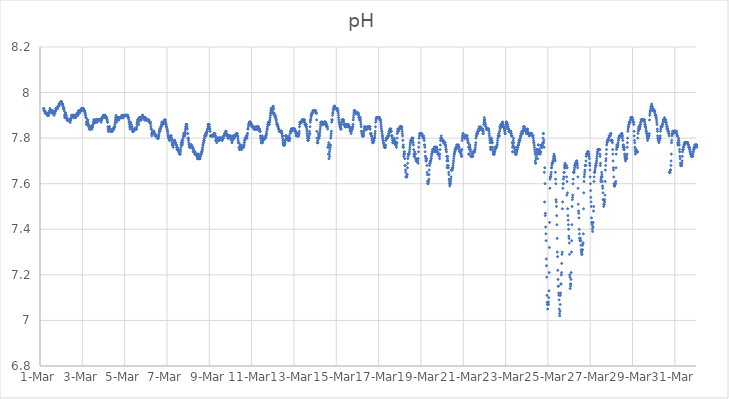
| Category | pH |
|---|---|
| 44621.166666666664 | 7.93 |
| 44621.177083333336 | 7.93 |
| 44621.1875 | 7.92 |
| 44621.197916666664 | 7.92 |
| 44621.208333333336 | 7.92 |
| 44621.21875 | 7.92 |
| 44621.229166666664 | 7.92 |
| 44621.239583333336 | 7.91 |
| 44621.25 | 7.91 |
| 44621.260416666664 | 7.91 |
| 44621.270833333336 | 7.91 |
| 44621.28125 | 7.91 |
| 44621.291666666664 | 7.91 |
| 44621.302083333336 | 7.91 |
| 44621.3125 | 7.91 |
| 44621.322916666664 | 7.91 |
| 44621.333333333336 | 7.91 |
| 44621.34375 | 7.9 |
| 44621.354166666664 | 7.9 |
| 44621.364583333336 | 7.9 |
| 44621.375 | 7.9 |
| 44621.385416666664 | 7.9 |
| 44621.395833333336 | 7.9 |
| 44621.40625 | 7.9 |
| 44621.416666666664 | 7.91 |
| 44621.427083333336 | 7.91 |
| 44621.4375 | 7.91 |
| 44621.447916666664 | 7.92 |
| 44621.458333333336 | 7.92 |
| 44621.46875 | 7.93 |
| 44621.479166666664 | 7.92 |
| 44621.489583333336 | 7.92 |
| 44621.5 | 7.92 |
| 44621.510416666664 | 7.92 |
| 44621.520833333336 | 7.92 |
| 44621.53125 | 7.92 |
| 44621.541666666664 | 7.92 |
| 44621.552083333336 | 7.91 |
| 44621.5625 | 7.92 |
| 44621.572916666664 | 7.92 |
| 44621.583333333336 | 7.92 |
| 44621.59375 | 7.91 |
| 44621.604166666664 | 7.92 |
| 44621.614583333336 | 7.91 |
| 44621.625 | 7.91 |
| 44621.635416666664 | 7.91 |
| 44621.645833333336 | 7.91 |
| 44621.65625 | 7.91 |
| 44621.666666666664 | 7.9 |
| 44621.677083333336 | 7.91 |
| 44621.6875 | 7.91 |
| 44621.697916666664 | 7.91 |
| 44621.708333333336 | 7.91 |
| 44621.71875 | 7.92 |
| 44621.729166666664 | 7.92 |
| 44621.739583333336 | 7.92 |
| 44621.75 | 7.93 |
| 44621.760416666664 | 7.93 |
| 44621.770833333336 | 7.93 |
| 44621.78125 | 7.93 |
| 44621.791666666664 | 7.93 |
| 44621.802083333336 | 7.93 |
| 44621.8125 | 7.93 |
| 44621.822916666664 | 7.93 |
| 44621.833333333336 | 7.93 |
| 44621.84375 | 7.94 |
| 44621.854166666664 | 7.94 |
| 44621.864583333336 | 7.94 |
| 44621.875 | 7.94 |
| 44621.885416666664 | 7.94 |
| 44621.895833333336 | 7.95 |
| 44621.90625 | 7.95 |
| 44621.916666666664 | 7.95 |
| 44621.927083333336 | 7.95 |
| 44621.9375 | 7.95 |
| 44621.947916666664 | 7.95 |
| 44621.958333333336 | 7.95 |
| 44621.96875 | 7.95 |
| 44621.979166666664 | 7.96 |
| 44621.989583333336 | 7.96 |
| 44622.0 | 7.96 |
| 44622.010416666664 | 7.96 |
| 44622.020833333336 | 7.96 |
| 44622.03125 | 7.95 |
| 44622.041666666664 | 7.95 |
| 44622.052083333336 | 7.95 |
| 44622.0625 | 7.95 |
| 44622.072916666664 | 7.95 |
| 44622.083333333336 | 7.94 |
| 44622.09375 | 7.94 |
| 44622.104166666664 | 7.93 |
| 44622.114583333336 | 7.93 |
| 44622.125 | 7.93 |
| 44622.135416666664 | 7.93 |
| 44622.145833333336 | 7.92 |
| 44622.15625 | 7.9 |
| 44622.166666666664 | 7.89 |
| 44622.177083333336 | 7.9 |
| 44622.1875 | 7.91 |
| 44622.197916666664 | 7.91 |
| 44622.208333333336 | 7.91 |
| 44622.21875 | 7.9 |
| 44622.229166666664 | 7.9 |
| 44622.239583333336 | 7.9 |
| 44622.25 | 7.89 |
| 44622.260416666664 | 7.89 |
| 44622.270833333336 | 7.88 |
| 44622.28125 | 7.88 |
| 44622.291666666664 | 7.88 |
| 44622.302083333336 | 7.88 |
| 44622.3125 | 7.88 |
| 44622.322916666664 | 7.88 |
| 44622.333333333336 | 7.88 |
| 44622.34375 | 7.88 |
| 44622.354166666664 | 7.88 |
| 44622.364583333336 | 7.88 |
| 44622.375 | 7.88 |
| 44622.385416666664 | 7.88 |
| 44622.395833333336 | 7.88 |
| 44622.40625 | 7.88 |
| 44622.416666666664 | 7.87 |
| 44622.427083333336 | 7.87 |
| 44622.4375 | 7.88 |
| 44622.447916666664 | 7.88 |
| 44622.458333333336 | 7.88 |
| 44622.46875 | 7.89 |
| 44622.479166666664 | 7.89 |
| 44622.489583333336 | 7.9 |
| 44622.5 | 7.9 |
| 44622.510416666664 | 7.9 |
| 44622.520833333336 | 7.9 |
| 44622.53125 | 7.9 |
| 44622.541666666664 | 7.9 |
| 44622.552083333336 | 7.9 |
| 44622.5625 | 7.9 |
| 44622.572916666664 | 7.9 |
| 44622.583333333336 | 7.89 |
| 44622.59375 | 7.89 |
| 44622.604166666664 | 7.9 |
| 44622.614583333336 | 7.9 |
| 44622.625 | 7.9 |
| 44622.635416666664 | 7.9 |
| 44622.645833333336 | 7.9 |
| 44622.65625 | 7.9 |
| 44622.666666666664 | 7.89 |
| 44622.677083333336 | 7.9 |
| 44622.6875 | 7.89 |
| 44622.697916666664 | 7.9 |
| 44622.708333333336 | 7.9 |
| 44622.71875 | 7.9 |
| 44622.729166666664 | 7.9 |
| 44622.739583333336 | 7.9 |
| 44622.75 | 7.91 |
| 44622.760416666664 | 7.91 |
| 44622.770833333336 | 7.91 |
| 44622.78125 | 7.9 |
| 44622.791666666664 | 7.9 |
| 44622.802083333336 | 7.91 |
| 44622.8125 | 7.91 |
| 44622.822916666664 | 7.92 |
| 44622.833333333336 | 7.92 |
| 44622.84375 | 7.92 |
| 44622.854166666664 | 7.92 |
| 44622.864583333336 | 7.91 |
| 44622.875 | 7.91 |
| 44622.885416666664 | 7.92 |
| 44622.895833333336 | 7.92 |
| 44622.90625 | 7.92 |
| 44622.916666666664 | 7.92 |
| 44622.927083333336 | 7.92 |
| 44622.9375 | 7.92 |
| 44622.947916666664 | 7.92 |
| 44622.958333333336 | 7.93 |
| 44622.96875 | 7.93 |
| 44622.979166666664 | 7.93 |
| 44622.989583333336 | 7.93 |
| 44623.0 | 7.93 |
| 44623.010416666664 | 7.93 |
| 44623.020833333336 | 7.93 |
| 44623.03125 | 7.93 |
| 44623.041666666664 | 7.93 |
| 44623.052083333336 | 7.93 |
| 44623.0625 | 7.92 |
| 44623.072916666664 | 7.92 |
| 44623.083333333336 | 7.92 |
| 44623.09375 | 7.92 |
| 44623.104166666664 | 7.92 |
| 44623.114583333336 | 7.92 |
| 44623.125 | 7.91 |
| 44623.135416666664 | 7.91 |
| 44623.145833333336 | 7.9 |
| 44623.15625 | 7.9 |
| 44623.166666666664 | 7.89 |
| 44623.177083333336 | 7.89 |
| 44623.1875 | 7.87 |
| 44623.197916666664 | 7.86 |
| 44623.208333333336 | 7.86 |
| 44623.21875 | 7.86 |
| 44623.229166666664 | 7.86 |
| 44623.239583333336 | 7.88 |
| 44623.25 | 7.88 |
| 44623.260416666664 | 7.88 |
| 44623.270833333336 | 7.87 |
| 44623.28125 | 7.86 |
| 44623.291666666664 | 7.86 |
| 44623.302083333336 | 7.85 |
| 44623.3125 | 7.85 |
| 44623.322916666664 | 7.84 |
| 44623.333333333336 | 7.85 |
| 44623.34375 | 7.84 |
| 44623.354166666664 | 7.84 |
| 44623.364583333336 | 7.84 |
| 44623.375 | 7.84 |
| 44623.385416666664 | 7.84 |
| 44623.395833333336 | 7.85 |
| 44623.40625 | 7.85 |
| 44623.416666666664 | 7.85 |
| 44623.427083333336 | 7.85 |
| 44623.4375 | 7.85 |
| 44623.447916666664 | 7.84 |
| 44623.458333333336 | 7.84 |
| 44623.46875 | 7.85 |
| 44623.479166666664 | 7.85 |
| 44623.489583333336 | 7.85 |
| 44623.5 | 7.86 |
| 44623.510416666664 | 7.86 |
| 44623.520833333336 | 7.87 |
| 44623.53125 | 7.87 |
| 44623.541666666664 | 7.88 |
| 44623.552083333336 | 7.88 |
| 44623.5625 | 7.88 |
| 44623.572916666664 | 7.88 |
| 44623.583333333336 | 7.87 |
| 44623.59375 | 7.87 |
| 44623.604166666664 | 7.87 |
| 44623.614583333336 | 7.87 |
| 44623.625 | 7.87 |
| 44623.635416666664 | 7.88 |
| 44623.645833333336 | 7.88 |
| 44623.65625 | 7.88 |
| 44623.666666666664 | 7.88 |
| 44623.677083333336 | 7.88 |
| 44623.6875 | 7.87 |
| 44623.697916666664 | 7.87 |
| 44623.708333333336 | 7.88 |
| 44623.71875 | 7.88 |
| 44623.729166666664 | 7.88 |
| 44623.739583333336 | 7.88 |
| 44623.75 | 7.88 |
| 44623.760416666664 | 7.88 |
| 44623.770833333336 | 7.88 |
| 44623.78125 | 7.88 |
| 44623.791666666664 | 7.88 |
| 44623.802083333336 | 7.88 |
| 44623.8125 | 7.88 |
| 44623.822916666664 | 7.88 |
| 44623.833333333336 | 7.88 |
| 44623.84375 | 7.88 |
| 44623.854166666664 | 7.88 |
| 44623.864583333336 | 7.88 |
| 44623.875 | 7.88 |
| 44623.885416666664 | 7.88 |
| 44623.895833333336 | 7.87 |
| 44623.90625 | 7.88 |
| 44623.916666666664 | 7.88 |
| 44623.927083333336 | 7.89 |
| 44623.9375 | 7.89 |
| 44623.947916666664 | 7.89 |
| 44623.958333333336 | 7.89 |
| 44623.96875 | 7.89 |
| 44623.979166666664 | 7.89 |
| 44623.989583333336 | 7.9 |
| 44624.0 | 7.9 |
| 44624.010416666664 | 7.89 |
| 44624.020833333336 | 7.89 |
| 44624.03125 | 7.9 |
| 44624.041666666664 | 7.9 |
| 44624.052083333336 | 7.9 |
| 44624.0625 | 7.9 |
| 44624.072916666664 | 7.9 |
| 44624.083333333336 | 7.9 |
| 44624.09375 | 7.89 |
| 44624.104166666664 | 7.89 |
| 44624.114583333336 | 7.89 |
| 44624.125 | 7.89 |
| 44624.135416666664 | 7.89 |
| 44624.145833333336 | 7.89 |
| 44624.15625 | 7.89 |
| 44624.166666666664 | 7.88 |
| 44624.177083333336 | 7.88 |
| 44624.1875 | 7.87 |
| 44624.197916666664 | 7.87 |
| 44624.208333333336 | 7.85 |
| 44624.21875 | 7.84 |
| 44624.229166666664 | 7.83 |
| 44624.239583333336 | 7.83 |
| 44624.25 | 7.84 |
| 44624.260416666664 | 7.84 |
| 44624.270833333336 | 7.85 |
| 44624.28125 | 7.85 |
| 44624.291666666664 | 7.84 |
| 44624.302083333336 | 7.84 |
| 44624.3125 | 7.84 |
| 44624.322916666664 | 7.83 |
| 44624.333333333336 | 7.83 |
| 44624.34375 | 7.83 |
| 44624.354166666664 | 7.83 |
| 44624.364583333336 | 7.83 |
| 44624.375 | 7.83 |
| 44624.385416666664 | 7.83 |
| 44624.395833333336 | 7.83 |
| 44624.40625 | 7.83 |
| 44624.416666666664 | 7.83 |
| 44624.427083333336 | 7.84 |
| 44624.4375 | 7.84 |
| 44624.447916666664 | 7.84 |
| 44624.458333333336 | 7.84 |
| 44624.46875 | 7.84 |
| 44624.479166666664 | 7.84 |
| 44624.489583333336 | 7.84 |
| 44624.5 | 7.84 |
| 44624.510416666664 | 7.85 |
| 44624.520833333336 | 7.85 |
| 44624.53125 | 7.85 |
| 44624.541666666664 | 7.86 |
| 44624.552083333336 | 7.87 |
| 44624.5625 | 7.88 |
| 44624.572916666664 | 7.89 |
| 44624.583333333336 | 7.89 |
| 44624.59375 | 7.9 |
| 44624.604166666664 | 7.89 |
| 44624.614583333336 | 7.89 |
| 44624.625 | 7.87 |
| 44624.635416666664 | 7.88 |
| 44624.645833333336 | 7.89 |
| 44624.65625 | 7.89 |
| 44624.666666666664 | 7.89 |
| 44624.677083333336 | 7.89 |
| 44624.6875 | 7.89 |
| 44624.697916666664 | 7.89 |
| 44624.708333333336 | 7.89 |
| 44624.71875 | 7.88 |
| 44624.729166666664 | 7.88 |
| 44624.739583333336 | 7.89 |
| 44624.75 | 7.89 |
| 44624.760416666664 | 7.89 |
| 44624.770833333336 | 7.89 |
| 44624.78125 | 7.89 |
| 44624.791666666664 | 7.89 |
| 44624.802083333336 | 7.89 |
| 44624.8125 | 7.89 |
| 44624.822916666664 | 7.89 |
| 44624.833333333336 | 7.89 |
| 44624.84375 | 7.89 |
| 44624.854166666664 | 7.89 |
| 44624.864583333336 | 7.9 |
| 44624.875 | 7.9 |
| 44624.885416666664 | 7.9 |
| 44624.895833333336 | 7.89 |
| 44624.90625 | 7.89 |
| 44624.916666666664 | 7.89 |
| 44624.927083333336 | 7.89 |
| 44624.9375 | 7.89 |
| 44624.947916666664 | 7.9 |
| 44624.958333333336 | 7.9 |
| 44624.96875 | 7.9 |
| 44624.979166666664 | 7.9 |
| 44624.989583333336 | 7.9 |
| 44625.0 | 7.9 |
| 44625.010416666664 | 7.9 |
| 44625.020833333336 | 7.9 |
| 44625.03125 | 7.9 |
| 44625.041666666664 | 7.9 |
| 44625.052083333336 | 7.9 |
| 44625.0625 | 7.9 |
| 44625.072916666664 | 7.9 |
| 44625.083333333336 | 7.9 |
| 44625.09375 | 7.9 |
| 44625.104166666664 | 7.9 |
| 44625.114583333336 | 7.9 |
| 44625.125 | 7.9 |
| 44625.135416666664 | 7.9 |
| 44625.145833333336 | 7.9 |
| 44625.15625 | 7.89 |
| 44625.166666666664 | 7.89 |
| 44625.177083333336 | 7.89 |
| 44625.1875 | 7.89 |
| 44625.197916666664 | 7.88 |
| 44625.208333333336 | 7.87 |
| 44625.21875 | 7.87 |
| 44625.229166666664 | 7.86 |
| 44625.239583333336 | 7.85 |
| 44625.25 | 7.84 |
| 44625.260416666664 | 7.85 |
| 44625.270833333336 | 7.86 |
| 44625.28125 | 7.87 |
| 44625.291666666664 | 7.86 |
| 44625.302083333336 | 7.86 |
| 44625.3125 | 7.86 |
| 44625.322916666664 | 7.85 |
| 44625.333333333336 | 7.85 |
| 44625.34375 | 7.85 |
| 44625.354166666664 | 7.84 |
| 44625.364583333336 | 7.83 |
| 44625.375 | 7.83 |
| 44625.385416666664 | 7.83 |
| 44625.395833333336 | 7.83 |
| 44625.40625 | 7.83 |
| 44625.416666666664 | 7.83 |
| 44625.427083333336 | 7.83 |
| 44625.4375 | 7.84 |
| 44625.447916666664 | 7.84 |
| 44625.458333333336 | 7.84 |
| 44625.46875 | 7.84 |
| 44625.479166666664 | 7.84 |
| 44625.489583333336 | 7.84 |
| 44625.5 | 7.84 |
| 44625.510416666664 | 7.84 |
| 44625.520833333336 | 7.84 |
| 44625.53125 | 7.84 |
| 44625.541666666664 | 7.84 |
| 44625.552083333336 | 7.84 |
| 44625.5625 | 7.84 |
| 44625.572916666664 | 7.85 |
| 44625.583333333336 | 7.86 |
| 44625.59375 | 7.87 |
| 44625.604166666664 | 7.87 |
| 44625.614583333336 | 7.88 |
| 44625.625 | 7.88 |
| 44625.635416666664 | 7.88 |
| 44625.645833333336 | 7.88 |
| 44625.65625 | 7.87 |
| 44625.666666666664 | 7.86 |
| 44625.677083333336 | 7.88 |
| 44625.6875 | 7.89 |
| 44625.697916666664 | 7.89 |
| 44625.708333333336 | 7.89 |
| 44625.71875 | 7.89 |
| 44625.729166666664 | 7.89 |
| 44625.739583333336 | 7.88 |
| 44625.75 | 7.88 |
| 44625.760416666664 | 7.88 |
| 44625.770833333336 | 7.88 |
| 44625.78125 | 7.88 |
| 44625.791666666664 | 7.89 |
| 44625.802083333336 | 7.89 |
| 44625.8125 | 7.89 |
| 44625.822916666664 | 7.89 |
| 44625.833333333336 | 7.9 |
| 44625.84375 | 7.9 |
| 44625.854166666664 | 7.9 |
| 44625.864583333336 | 7.89 |
| 44625.875 | 7.89 |
| 44625.885416666664 | 7.89 |
| 44625.895833333336 | 7.89 |
| 44625.90625 | 7.89 |
| 44625.916666666664 | 7.89 |
| 44625.927083333336 | 7.89 |
| 44625.9375 | 7.88 |
| 44625.947916666664 | 7.88 |
| 44625.958333333336 | 7.89 |
| 44625.96875 | 7.89 |
| 44625.979166666664 | 7.89 |
| 44625.989583333336 | 7.89 |
| 44626.0 | 7.88 |
| 44626.010416666664 | 7.88 |
| 44626.020833333336 | 7.88 |
| 44626.03125 | 7.88 |
| 44626.041666666664 | 7.88 |
| 44626.052083333336 | 7.88 |
| 44626.0625 | 7.88 |
| 44626.072916666664 | 7.88 |
| 44626.083333333336 | 7.88 |
| 44626.09375 | 7.88 |
| 44626.104166666664 | 7.88 |
| 44626.114583333336 | 7.88 |
| 44626.125 | 7.88 |
| 44626.135416666664 | 7.88 |
| 44626.145833333336 | 7.88 |
| 44626.15625 | 7.87 |
| 44626.166666666664 | 7.87 |
| 44626.177083333336 | 7.87 |
| 44626.1875 | 7.87 |
| 44626.197916666664 | 7.87 |
| 44626.208333333336 | 7.87 |
| 44626.21875 | 7.87 |
| 44626.229166666664 | 7.86 |
| 44626.239583333336 | 7.85 |
| 44626.25 | 7.84 |
| 44626.260416666664 | 7.84 |
| 44626.270833333336 | 7.82 |
| 44626.28125 | 7.81 |
| 44626.291666666664 | 7.82 |
| 44626.302083333336 | 7.82 |
| 44626.3125 | 7.83 |
| 44626.322916666664 | 7.83 |
| 44626.333333333336 | 7.83 |
| 44626.34375 | 7.83 |
| 44626.354166666664 | 7.83 |
| 44626.364583333336 | 7.83 |
| 44626.375 | 7.83 |
| 44626.385416666664 | 7.83 |
| 44626.395833333336 | 7.82 |
| 44626.40625 | 7.82 |
| 44626.416666666664 | 7.82 |
| 44626.427083333336 | 7.82 |
| 44626.4375 | 7.81 |
| 44626.447916666664 | 7.81 |
| 44626.458333333336 | 7.81 |
| 44626.46875 | 7.81 |
| 44626.479166666664 | 7.81 |
| 44626.489583333336 | 7.81 |
| 44626.5 | 7.81 |
| 44626.510416666664 | 7.81 |
| 44626.520833333336 | 7.81 |
| 44626.53125 | 7.81 |
| 44626.541666666664 | 7.8 |
| 44626.552083333336 | 7.8 |
| 44626.5625 | 7.8 |
| 44626.572916666664 | 7.8 |
| 44626.583333333336 | 7.8 |
| 44626.59375 | 7.8 |
| 44626.604166666664 | 7.81 |
| 44626.614583333336 | 7.81 |
| 44626.625 | 7.82 |
| 44626.635416666664 | 7.83 |
| 44626.645833333336 | 7.83 |
| 44626.65625 | 7.84 |
| 44626.666666666664 | 7.84 |
| 44626.677083333336 | 7.83 |
| 44626.6875 | 7.84 |
| 44626.697916666664 | 7.84 |
| 44626.708333333336 | 7.85 |
| 44626.71875 | 7.85 |
| 44626.729166666664 | 7.85 |
| 44626.739583333336 | 7.86 |
| 44626.75 | 7.86 |
| 44626.760416666664 | 7.87 |
| 44626.770833333336 | 7.87 |
| 44626.78125 | 7.87 |
| 44626.791666666664 | 7.86 |
| 44626.802083333336 | 7.86 |
| 44626.8125 | 7.87 |
| 44626.822916666664 | 7.87 |
| 44626.833333333336 | 7.87 |
| 44626.84375 | 7.87 |
| 44626.854166666664 | 7.87 |
| 44626.864583333336 | 7.87 |
| 44626.875 | 7.87 |
| 44626.885416666664 | 7.88 |
| 44626.895833333336 | 7.88 |
| 44626.90625 | 7.88 |
| 44626.916666666664 | 7.87 |
| 44626.927083333336 | 7.88 |
| 44626.9375 | 7.87 |
| 44626.947916666664 | 7.86 |
| 44626.958333333336 | 7.86 |
| 44626.96875 | 7.85 |
| 44626.979166666664 | 7.85 |
| 44626.989583333336 | 7.85 |
| 44627.0 | 7.84 |
| 44627.010416666664 | 7.84 |
| 44627.020833333336 | 7.83 |
| 44627.03125 | 7.83 |
| 44627.041666666664 | 7.82 |
| 44627.052083333336 | 7.81 |
| 44627.0625 | 7.81 |
| 44627.072916666664 | 7.8 |
| 44627.083333333336 | 7.8 |
| 44627.09375 | 7.8 |
| 44627.104166666664 | 7.8 |
| 44627.114583333336 | 7.79 |
| 44627.125 | 7.79 |
| 44627.135416666664 | 7.8 |
| 44627.145833333336 | 7.8 |
| 44627.15625 | 7.8 |
| 44627.166666666664 | 7.81 |
| 44627.177083333336 | 7.81 |
| 44627.1875 | 7.81 |
| 44627.197916666664 | 7.81 |
| 44627.208333333336 | 7.8 |
| 44627.21875 | 7.8 |
| 44627.229166666664 | 7.79 |
| 44627.239583333336 | 7.78 |
| 44627.25 | 7.77 |
| 44627.260416666664 | 7.77 |
| 44627.270833333336 | 7.77 |
| 44627.28125 | 7.77 |
| 44627.291666666664 | 7.76 |
| 44627.302083333336 | 7.77 |
| 44627.3125 | 7.78 |
| 44627.322916666664 | 7.79 |
| 44627.333333333336 | 7.79 |
| 44627.34375 | 7.79 |
| 44627.354166666664 | 7.79 |
| 44627.364583333336 | 7.79 |
| 44627.375 | 7.78 |
| 44627.385416666664 | 7.78 |
| 44627.395833333336 | 7.78 |
| 44627.40625 | 7.78 |
| 44627.416666666664 | 7.78 |
| 44627.427083333336 | 7.77 |
| 44627.4375 | 7.77 |
| 44627.447916666664 | 7.77 |
| 44627.458333333336 | 7.76 |
| 44627.46875 | 7.75 |
| 44627.479166666664 | 7.76 |
| 44627.489583333336 | 7.76 |
| 44627.5 | 7.75 |
| 44627.510416666664 | 7.75 |
| 44627.520833333336 | 7.75 |
| 44627.53125 | 7.75 |
| 44627.541666666664 | 7.75 |
| 44627.552083333336 | 7.74 |
| 44627.5625 | 7.74 |
| 44627.572916666664 | 7.74 |
| 44627.583333333336 | 7.74 |
| 44627.59375 | 7.73 |
| 44627.604166666664 | 7.73 |
| 44627.614583333336 | 7.73 |
| 44627.625 | 7.73 |
| 44627.635416666664 | 7.74 |
| 44627.645833333336 | 7.75 |
| 44627.65625 | 7.76 |
| 44627.666666666664 | 7.77 |
| 44627.677083333336 | 7.78 |
| 44627.6875 | 7.78 |
| 44627.697916666664 | 7.79 |
| 44627.708333333336 | 7.78 |
| 44627.71875 | 7.78 |
| 44627.729166666664 | 7.77 |
| 44627.739583333336 | 7.78 |
| 44627.75 | 7.79 |
| 44627.760416666664 | 7.8 |
| 44627.770833333336 | 7.81 |
| 44627.78125 | 7.81 |
| 44627.791666666664 | 7.82 |
| 44627.802083333336 | 7.82 |
| 44627.8125 | 7.82 |
| 44627.822916666664 | 7.82 |
| 44627.833333333336 | 7.81 |
| 44627.84375 | 7.81 |
| 44627.854166666664 | 7.82 |
| 44627.864583333336 | 7.83 |
| 44627.875 | 7.84 |
| 44627.885416666664 | 7.85 |
| 44627.895833333336 | 7.85 |
| 44627.90625 | 7.86 |
| 44627.916666666664 | 7.86 |
| 44627.927083333336 | 7.86 |
| 44627.9375 | 7.86 |
| 44627.947916666664 | 7.85 |
| 44627.958333333336 | 7.84 |
| 44627.96875 | 7.82 |
| 44627.979166666664 | 7.82 |
| 44627.989583333336 | 7.8 |
| 44628.0 | 7.8 |
| 44628.010416666664 | 7.8 |
| 44628.020833333336 | 7.79 |
| 44628.03125 | 7.78 |
| 44628.041666666664 | 7.77 |
| 44628.052083333336 | 7.77 |
| 44628.0625 | 7.76 |
| 44628.072916666664 | 7.76 |
| 44628.083333333336 | 7.76 |
| 44628.09375 | 7.76 |
| 44628.104166666664 | 7.76 |
| 44628.114583333336 | 7.77 |
| 44628.125 | 7.77 |
| 44628.135416666664 | 7.77 |
| 44628.145833333336 | 7.77 |
| 44628.15625 | 7.77 |
| 44628.166666666664 | 7.77 |
| 44628.177083333336 | 7.76 |
| 44628.1875 | 7.76 |
| 44628.197916666664 | 7.76 |
| 44628.208333333336 | 7.76 |
| 44628.21875 | 7.76 |
| 44628.229166666664 | 7.74 |
| 44628.239583333336 | 7.75 |
| 44628.25 | 7.75 |
| 44628.260416666664 | 7.75 |
| 44628.270833333336 | 7.74 |
| 44628.28125 | 7.74 |
| 44628.291666666664 | 7.74 |
| 44628.302083333336 | 7.74 |
| 44628.3125 | 7.73 |
| 44628.322916666664 | 7.74 |
| 44628.333333333336 | 7.73 |
| 44628.34375 | 7.73 |
| 44628.354166666664 | 7.73 |
| 44628.364583333336 | 7.73 |
| 44628.375 | 7.73 |
| 44628.385416666664 | 7.73 |
| 44628.395833333336 | 7.73 |
| 44628.40625 | 7.73 |
| 44628.416666666664 | 7.72 |
| 44628.427083333336 | 7.72 |
| 44628.4375 | 7.71 |
| 44628.447916666664 | 7.71 |
| 44628.458333333336 | 7.71 |
| 44628.46875 | 7.73 |
| 44628.479166666664 | 7.73 |
| 44628.489583333336 | 7.72 |
| 44628.5 | 7.72 |
| 44628.510416666664 | 7.71 |
| 44628.520833333336 | 7.71 |
| 44628.53125 | 7.71 |
| 44628.541666666664 | 7.71 |
| 44628.552083333336 | 7.71 |
| 44628.5625 | 7.71 |
| 44628.572916666664 | 7.72 |
| 44628.583333333336 | 7.72 |
| 44628.59375 | 7.73 |
| 44628.604166666664 | 7.73 |
| 44628.614583333336 | 7.73 |
| 44628.625 | 7.73 |
| 44628.635416666664 | 7.74 |
| 44628.645833333336 | 7.74 |
| 44628.65625 | 7.74 |
| 44628.666666666664 | 7.75 |
| 44628.677083333336 | 7.75 |
| 44628.6875 | 7.76 |
| 44628.697916666664 | 7.77 |
| 44628.708333333336 | 7.77 |
| 44628.71875 | 7.78 |
| 44628.729166666664 | 7.78 |
| 44628.739583333336 | 7.79 |
| 44628.75 | 7.79 |
| 44628.760416666664 | 7.79 |
| 44628.770833333336 | 7.8 |
| 44628.78125 | 7.81 |
| 44628.791666666664 | 7.81 |
| 44628.802083333336 | 7.81 |
| 44628.8125 | 7.81 |
| 44628.822916666664 | 7.82 |
| 44628.833333333336 | 7.82 |
| 44628.84375 | 7.82 |
| 44628.854166666664 | 7.81 |
| 44628.864583333336 | 7.82 |
| 44628.875 | 7.82 |
| 44628.885416666664 | 7.83 |
| 44628.895833333336 | 7.83 |
| 44628.90625 | 7.83 |
| 44628.916666666664 | 7.84 |
| 44628.927083333336 | 7.84 |
| 44628.9375 | 7.85 |
| 44628.947916666664 | 7.86 |
| 44628.958333333336 | 7.86 |
| 44628.96875 | 7.86 |
| 44628.979166666664 | 7.86 |
| 44628.989583333336 | 7.86 |
| 44629.0 | 7.86 |
| 44629.010416666664 | 7.85 |
| 44629.020833333336 | 7.84 |
| 44629.03125 | 7.84 |
| 44629.041666666664 | 7.83 |
| 44629.052083333336 | 7.81 |
| 44629.0625 | 7.81 |
| 44629.072916666664 | 7.81 |
| 44629.083333333336 | 7.81 |
| 44629.09375 | 7.81 |
| 44629.104166666664 | 7.81 |
| 44629.114583333336 | 7.81 |
| 44629.125 | 7.81 |
| 44629.135416666664 | 7.81 |
| 44629.145833333336 | 7.81 |
| 44629.15625 | 7.81 |
| 44629.166666666664 | 7.81 |
| 44629.177083333336 | 7.81 |
| 44629.1875 | 7.81 |
| 44629.197916666664 | 7.81 |
| 44629.208333333336 | 7.81 |
| 44629.21875 | 7.82 |
| 44629.229166666664 | 7.82 |
| 44629.239583333336 | 7.82 |
| 44629.25 | 7.81 |
| 44629.260416666664 | 7.81 |
| 44629.270833333336 | 7.82 |
| 44629.28125 | 7.81 |
| 44629.291666666664 | 7.81 |
| 44629.302083333336 | 7.79 |
| 44629.3125 | 7.79 |
| 44629.322916666664 | 7.8 |
| 44629.333333333336 | 7.79 |
| 44629.34375 | 7.79 |
| 44629.354166666664 | 7.78 |
| 44629.364583333336 | 7.79 |
| 44629.375 | 7.8 |
| 44629.385416666664 | 7.8 |
| 44629.395833333336 | 7.8 |
| 44629.40625 | 7.8 |
| 44629.416666666664 | 7.8 |
| 44629.427083333336 | 7.8 |
| 44629.4375 | 7.79 |
| 44629.447916666664 | 7.79 |
| 44629.458333333336 | 7.79 |
| 44629.46875 | 7.79 |
| 44629.479166666664 | 7.8 |
| 44629.489583333336 | 7.8 |
| 44629.5 | 7.8 |
| 44629.510416666664 | 7.8 |
| 44629.520833333336 | 7.8 |
| 44629.53125 | 7.8 |
| 44629.541666666664 | 7.8 |
| 44629.552083333336 | 7.8 |
| 44629.5625 | 7.8 |
| 44629.572916666664 | 7.8 |
| 44629.583333333336 | 7.8 |
| 44629.59375 | 7.8 |
| 44629.604166666664 | 7.79 |
| 44629.614583333336 | 7.79 |
| 44629.625 | 7.8 |
| 44629.635416666664 | 7.8 |
| 44629.645833333336 | 7.8 |
| 44629.65625 | 7.8 |
| 44629.666666666664 | 7.8 |
| 44629.677083333336 | 7.81 |
| 44629.6875 | 7.81 |
| 44629.697916666664 | 7.81 |
| 44629.708333333336 | 7.81 |
| 44629.71875 | 7.82 |
| 44629.729166666664 | 7.82 |
| 44629.739583333336 | 7.82 |
| 44629.75 | 7.82 |
| 44629.760416666664 | 7.82 |
| 44629.770833333336 | 7.83 |
| 44629.78125 | 7.82 |
| 44629.791666666664 | 7.82 |
| 44629.802083333336 | 7.83 |
| 44629.8125 | 7.82 |
| 44629.822916666664 | 7.82 |
| 44629.833333333336 | 7.81 |
| 44629.84375 | 7.81 |
| 44629.854166666664 | 7.81 |
| 44629.864583333336 | 7.81 |
| 44629.875 | 7.8 |
| 44629.885416666664 | 7.81 |
| 44629.895833333336 | 7.8 |
| 44629.90625 | 7.81 |
| 44629.916666666664 | 7.81 |
| 44629.927083333336 | 7.81 |
| 44629.9375 | 7.81 |
| 44629.947916666664 | 7.81 |
| 44629.958333333336 | 7.81 |
| 44629.96875 | 7.8 |
| 44629.979166666664 | 7.81 |
| 44629.989583333336 | 7.8 |
| 44630.0 | 7.8 |
| 44630.010416666664 | 7.8 |
| 44630.020833333336 | 7.81 |
| 44630.03125 | 7.8 |
| 44630.041666666664 | 7.8 |
| 44630.052083333336 | 7.79 |
| 44630.0625 | 7.8 |
| 44630.072916666664 | 7.78 |
| 44630.083333333336 | 7.79 |
| 44630.09375 | 7.79 |
| 44630.104166666664 | 7.8 |
| 44630.114583333336 | 7.8 |
| 44630.125 | 7.81 |
| 44630.135416666664 | 7.81 |
| 44630.145833333336 | 7.8 |
| 44630.15625 | 7.8 |
| 44630.166666666664 | 7.8 |
| 44630.177083333336 | 7.8 |
| 44630.1875 | 7.81 |
| 44630.197916666664 | 7.81 |
| 44630.208333333336 | 7.81 |
| 44630.21875 | 7.81 |
| 44630.229166666664 | 7.81 |
| 44630.239583333336 | 7.81 |
| 44630.25 | 7.81 |
| 44630.260416666664 | 7.81 |
| 44630.270833333336 | 7.82 |
| 44630.28125 | 7.82 |
| 44630.291666666664 | 7.82 |
| 44630.302083333336 | 7.82 |
| 44630.3125 | 7.82 |
| 44630.322916666664 | 7.82 |
| 44630.333333333336 | 7.81 |
| 44630.34375 | 7.81 |
| 44630.354166666664 | 7.8 |
| 44630.364583333336 | 7.79 |
| 44630.375 | 7.78 |
| 44630.385416666664 | 7.78 |
| 44630.395833333336 | 7.78 |
| 44630.40625 | 7.76 |
| 44630.416666666664 | 7.76 |
| 44630.427083333336 | 7.75 |
| 44630.4375 | 7.75 |
| 44630.447916666664 | 7.76 |
| 44630.458333333336 | 7.77 |
| 44630.46875 | 7.76 |
| 44630.479166666664 | 7.76 |
| 44630.489583333336 | 7.76 |
| 44630.5 | 7.76 |
| 44630.510416666664 | 7.77 |
| 44630.520833333336 | 7.76 |
| 44630.53125 | 7.75 |
| 44630.541666666664 | 7.76 |
| 44630.552083333336 | 7.76 |
| 44630.5625 | 7.76 |
| 44630.572916666664 | 7.76 |
| 44630.583333333336 | 7.76 |
| 44630.59375 | 7.76 |
| 44630.604166666664 | 7.76 |
| 44630.614583333336 | 7.76 |
| 44630.625 | 7.76 |
| 44630.635416666664 | 7.77 |
| 44630.645833333336 | 7.77 |
| 44630.65625 | 7.78 |
| 44630.666666666664 | 7.79 |
| 44630.677083333336 | 7.79 |
| 44630.6875 | 7.8 |
| 44630.697916666664 | 7.8 |
| 44630.708333333336 | 7.8 |
| 44630.71875 | 7.8 |
| 44630.729166666664 | 7.8 |
| 44630.739583333336 | 7.8 |
| 44630.75 | 7.81 |
| 44630.760416666664 | 7.81 |
| 44630.770833333336 | 7.8 |
| 44630.78125 | 7.8 |
| 44630.791666666664 | 7.81 |
| 44630.802083333336 | 7.82 |
| 44630.8125 | 7.82 |
| 44630.822916666664 | 7.84 |
| 44630.833333333336 | 7.84 |
| 44630.84375 | 7.85 |
| 44630.854166666664 | 7.86 |
| 44630.864583333336 | 7.86 |
| 44630.875 | 7.86 |
| 44630.885416666664 | 7.87 |
| 44630.895833333336 | 7.87 |
| 44630.90625 | 7.87 |
| 44630.916666666664 | 7.87 |
| 44630.927083333336 | 7.87 |
| 44630.9375 | 7.87 |
| 44630.947916666664 | 7.87 |
| 44630.958333333336 | 7.86 |
| 44630.96875 | 7.86 |
| 44630.979166666664 | 7.86 |
| 44630.989583333336 | 7.86 |
| 44631.0 | 7.86 |
| 44631.010416666664 | 7.85 |
| 44631.020833333336 | 7.85 |
| 44631.03125 | 7.85 |
| 44631.041666666664 | 7.85 |
| 44631.052083333336 | 7.85 |
| 44631.0625 | 7.85 |
| 44631.072916666664 | 7.85 |
| 44631.083333333336 | 7.85 |
| 44631.09375 | 7.85 |
| 44631.104166666664 | 7.84 |
| 44631.114583333336 | 7.84 |
| 44631.125 | 7.84 |
| 44631.135416666664 | 7.84 |
| 44631.145833333336 | 7.84 |
| 44631.15625 | 7.84 |
| 44631.166666666664 | 7.84 |
| 44631.177083333336 | 7.85 |
| 44631.1875 | 7.84 |
| 44631.197916666664 | 7.84 |
| 44631.208333333336 | 7.84 |
| 44631.21875 | 7.84 |
| 44631.229166666664 | 7.84 |
| 44631.239583333336 | 7.85 |
| 44631.25 | 7.85 |
| 44631.260416666664 | 7.84 |
| 44631.270833333336 | 7.84 |
| 44631.28125 | 7.84 |
| 44631.291666666664 | 7.84 |
| 44631.302083333336 | 7.85 |
| 44631.3125 | 7.85 |
| 44631.322916666664 | 7.85 |
| 44631.333333333336 | 7.84 |
| 44631.34375 | 7.84 |
| 44631.354166666664 | 7.84 |
| 44631.364583333336 | 7.84 |
| 44631.375 | 7.84 |
| 44631.385416666664 | 7.83 |
| 44631.395833333336 | 7.83 |
| 44631.40625 | 7.83 |
| 44631.416666666664 | 7.81 |
| 44631.427083333336 | 7.8 |
| 44631.4375 | 7.8 |
| 44631.447916666664 | 7.79 |
| 44631.458333333336 | 7.78 |
| 44631.46875 | 7.78 |
| 44631.479166666664 | 7.78 |
| 44631.489583333336 | 7.8 |
| 44631.5 | 7.81 |
| 44631.510416666664 | 7.8 |
| 44631.520833333336 | 7.78 |
| 44631.53125 | 7.79 |
| 44631.541666666664 | 7.79 |
| 44631.552083333336 | 7.79 |
| 44631.5625 | 7.8 |
| 44631.572916666664 | 7.8 |
| 44631.583333333336 | 7.8 |
| 44631.59375 | 7.8 |
| 44631.604166666664 | 7.8 |
| 44631.614583333336 | 7.8 |
| 44631.625 | 7.8 |
| 44631.635416666664 | 7.8 |
| 44631.645833333336 | 7.8 |
| 44631.65625 | 7.8 |
| 44631.666666666664 | 7.81 |
| 44631.677083333336 | 7.81 |
| 44631.6875 | 7.81 |
| 44631.697916666664 | 7.82 |
| 44631.708333333336 | 7.82 |
| 44631.71875 | 7.83 |
| 44631.729166666664 | 7.84 |
| 44631.739583333336 | 7.84 |
| 44631.75 | 7.85 |
| 44631.760416666664 | 7.86 |
| 44631.770833333336 | 7.86 |
| 44631.78125 | 7.86 |
| 44631.791666666664 | 7.87 |
| 44631.802083333336 | 7.87 |
| 44631.8125 | 7.86 |
| 44631.822916666664 | 7.86 |
| 44631.833333333336 | 7.86 |
| 44631.84375 | 7.87 |
| 44631.854166666664 | 7.87 |
| 44631.864583333336 | 7.88 |
| 44631.875 | 7.89 |
| 44631.885416666664 | 7.9 |
| 44631.895833333336 | 7.91 |
| 44631.90625 | 7.92 |
| 44631.916666666664 | 7.91 |
| 44631.927083333336 | 7.93 |
| 44631.9375 | 7.93 |
| 44631.947916666664 | 7.92 |
| 44631.958333333336 | 7.92 |
| 44631.96875 | 7.91 |
| 44631.979166666664 | 7.91 |
| 44631.989583333336 | 7.92 |
| 44632.0 | 7.93 |
| 44632.010416666664 | 7.94 |
| 44632.020833333336 | 7.94 |
| 44632.03125 | 7.93 |
| 44632.041666666664 | 7.93 |
| 44632.052083333336 | 7.91 |
| 44632.0625 | 7.91 |
| 44632.072916666664 | 7.9 |
| 44632.083333333336 | 7.9 |
| 44632.09375 | 7.9 |
| 44632.104166666664 | 7.9 |
| 44632.114583333336 | 7.9 |
| 44632.125 | 7.89 |
| 44632.135416666664 | 7.89 |
| 44632.145833333336 | 7.89 |
| 44632.15625 | 7.88 |
| 44632.166666666664 | 7.88 |
| 44632.177083333336 | 7.87 |
| 44632.1875 | 7.86 |
| 44632.197916666664 | 7.86 |
| 44632.208333333336 | 7.86 |
| 44632.21875 | 7.86 |
| 44632.229166666664 | 7.86 |
| 44632.239583333336 | 7.85 |
| 44632.25 | 7.85 |
| 44632.260416666664 | 7.85 |
| 44632.270833333336 | 7.84 |
| 44632.28125 | 7.84 |
| 44632.291666666664 | 7.84 |
| 44632.302083333336 | 7.83 |
| 44632.3125 | 7.83 |
| 44632.322916666664 | 7.83 |
| 44632.333333333336 | 7.83 |
| 44632.34375 | 7.83 |
| 44632.354166666664 | 7.83 |
| 44632.364583333336 | 7.83 |
| 44632.375 | 7.83 |
| 44632.385416666664 | 7.83 |
| 44632.395833333336 | 7.83 |
| 44632.40625 | 7.83 |
| 44632.416666666664 | 7.83 |
| 44632.427083333336 | 7.82 |
| 44632.4375 | 7.82 |
| 44632.447916666664 | 7.81 |
| 44632.458333333336 | 7.81 |
| 44632.46875 | 7.8 |
| 44632.479166666664 | 7.79 |
| 44632.489583333336 | 7.78 |
| 44632.5 | 7.77 |
| 44632.510416666664 | 7.77 |
| 44632.520833333336 | 7.78 |
| 44632.53125 | 7.77 |
| 44632.541666666664 | 7.77 |
| 44632.552083333336 | 7.77 |
| 44632.5625 | 7.77 |
| 44632.572916666664 | 7.79 |
| 44632.583333333336 | 7.78 |
| 44632.59375 | 7.79 |
| 44632.604166666664 | 7.81 |
| 44632.614583333336 | 7.81 |
| 44632.625 | 7.81 |
| 44632.635416666664 | 7.81 |
| 44632.645833333336 | 7.8 |
| 44632.65625 | 7.8 |
| 44632.666666666664 | 7.8 |
| 44632.677083333336 | 7.8 |
| 44632.6875 | 7.8 |
| 44632.697916666664 | 7.8 |
| 44632.708333333336 | 7.8 |
| 44632.71875 | 7.8 |
| 44632.729166666664 | 7.79 |
| 44632.739583333336 | 7.8 |
| 44632.75 | 7.79 |
| 44632.760416666664 | 7.8 |
| 44632.770833333336 | 7.81 |
| 44632.78125 | 7.79 |
| 44632.791666666664 | 7.79 |
| 44632.802083333336 | 7.8 |
| 44632.8125 | 7.8 |
| 44632.822916666664 | 7.82 |
| 44632.833333333336 | 7.83 |
| 44632.84375 | 7.83 |
| 44632.854166666664 | 7.83 |
| 44632.864583333336 | 7.84 |
| 44632.875 | 7.84 |
| 44632.885416666664 | 7.83 |
| 44632.895833333336 | 7.83 |
| 44632.90625 | 7.84 |
| 44632.916666666664 | 7.84 |
| 44632.927083333336 | 7.84 |
| 44632.9375 | 7.84 |
| 44632.947916666664 | 7.84 |
| 44632.958333333336 | 7.84 |
| 44632.96875 | 7.84 |
| 44632.979166666664 | 7.84 |
| 44632.989583333336 | 7.84 |
| 44633.0 | 7.84 |
| 44633.010416666664 | 7.84 |
| 44633.020833333336 | 7.84 |
| 44633.03125 | 7.84 |
| 44633.041666666664 | 7.84 |
| 44633.052083333336 | 7.83 |
| 44633.0625 | 7.83 |
| 44633.072916666664 | 7.83 |
| 44633.083333333336 | 7.83 |
| 44633.09375 | 7.82 |
| 44633.104166666664 | 7.81 |
| 44633.114583333336 | 7.82 |
| 44633.125 | 7.81 |
| 44633.135416666664 | 7.82 |
| 44633.145833333336 | 7.82 |
| 44633.15625 | 7.82 |
| 44633.166666666664 | 7.82 |
| 44633.177083333336 | 7.81 |
| 44633.1875 | 7.81 |
| 44633.197916666664 | 7.81 |
| 44633.208333333336 | 7.81 |
| 44633.21875 | 7.81 |
| 44633.229166666664 | 7.82 |
| 44633.239583333336 | 7.82 |
| 44633.25 | 7.83 |
| 44633.260416666664 | 7.85 |
| 44633.270833333336 | 7.86 |
| 44633.28125 | 7.87 |
| 44633.291666666664 | 7.87 |
| 44633.302083333336 | 7.87 |
| 44633.3125 | 7.87 |
| 44633.322916666664 | 7.87 |
| 44633.333333333336 | 7.87 |
| 44633.34375 | 7.87 |
| 44633.354166666664 | 7.87 |
| 44633.364583333336 | 7.87 |
| 44633.375 | 7.87 |
| 44633.385416666664 | 7.88 |
| 44633.395833333336 | 7.88 |
| 44633.40625 | 7.88 |
| 44633.416666666664 | 7.88 |
| 44633.427083333336 | 7.88 |
| 44633.4375 | 7.88 |
| 44633.447916666664 | 7.88 |
| 44633.458333333336 | 7.88 |
| 44633.46875 | 7.88 |
| 44633.479166666664 | 7.87 |
| 44633.489583333336 | 7.88 |
| 44633.5 | 7.88 |
| 44633.510416666664 | 7.87 |
| 44633.520833333336 | 7.86 |
| 44633.53125 | 7.86 |
| 44633.541666666664 | 7.86 |
| 44633.552083333336 | 7.86 |
| 44633.5625 | 7.86 |
| 44633.572916666664 | 7.85 |
| 44633.583333333336 | 7.86 |
| 44633.59375 | 7.85 |
| 44633.604166666664 | 7.84 |
| 44633.614583333336 | 7.83 |
| 44633.625 | 7.82 |
| 44633.635416666664 | 7.81 |
| 44633.645833333336 | 7.8 |
| 44633.65625 | 7.79 |
| 44633.666666666664 | 7.79 |
| 44633.677083333336 | 7.79 |
| 44633.6875 | 7.8 |
| 44633.697916666664 | 7.8 |
| 44633.708333333336 | 7.8 |
| 44633.71875 | 7.81 |
| 44633.729166666664 | 7.83 |
| 44633.739583333336 | 7.82 |
| 44633.75 | 7.82 |
| 44633.760416666664 | 7.85 |
| 44633.770833333336 | 7.87 |
| 44633.78125 | 7.88 |
| 44633.791666666664 | 7.88 |
| 44633.802083333336 | 7.89 |
| 44633.8125 | 7.9 |
| 44633.822916666664 | 7.9 |
| 44633.833333333336 | 7.9 |
| 44633.84375 | 7.91 |
| 44633.854166666664 | 7.91 |
| 44633.864583333336 | 7.91 |
| 44633.875 | 7.91 |
| 44633.885416666664 | 7.91 |
| 44633.895833333336 | 7.92 |
| 44633.90625 | 7.92 |
| 44633.916666666664 | 7.92 |
| 44633.927083333336 | 7.92 |
| 44633.9375 | 7.92 |
| 44633.947916666664 | 7.92 |
| 44633.958333333336 | 7.92 |
| 44633.96875 | 7.92 |
| 44633.979166666664 | 7.92 |
| 44633.989583333336 | 7.92 |
| 44634.0 | 7.92 |
| 44634.010416666664 | 7.92 |
| 44634.020833333336 | 7.92 |
| 44634.03125 | 7.92 |
| 44634.041666666664 | 7.91 |
| 44634.052083333336 | 7.91 |
| 44634.0625 | 7.91 |
| 44634.072916666664 | 7.88 |
| 44634.083333333336 | 7.83 |
| 44634.09375 | 7.8 |
| 44634.104166666664 | 7.78 |
| 44634.114583333336 | 7.78 |
| 44634.125 | 7.79 |
| 44634.135416666664 | 7.78 |
| 44634.145833333336 | 7.8 |
| 44634.15625 | 7.82 |
| 44634.166666666664 | 7.81 |
| 44634.177083333336 | 7.8 |
| 44634.1875 | 7.8 |
| 44634.197916666664 | 7.81 |
| 44634.208333333336 | 7.81 |
| 44634.21875 | 7.82 |
| 44634.229166666664 | 7.83 |
| 44634.239583333336 | 7.84 |
| 44634.25 | 7.85 |
| 44634.260416666664 | 7.86 |
| 44634.270833333336 | 7.87 |
| 44634.28125 | 7.87 |
| 44634.291666666664 | 7.87 |
| 44634.302083333336 | 7.87 |
| 44634.3125 | 7.87 |
| 44634.322916666664 | 7.87 |
| 44634.333333333336 | 7.87 |
| 44634.34375 | 7.86 |
| 44634.354166666664 | 7.86 |
| 44634.364583333336 | 7.86 |
| 44634.375 | 7.86 |
| 44634.385416666664 | 7.86 |
| 44634.395833333336 | 7.86 |
| 44634.40625 | 7.86 |
| 44634.416666666664 | 7.87 |
| 44634.427083333336 | 7.87 |
| 44634.4375 | 7.87 |
| 44634.447916666664 | 7.87 |
| 44634.458333333336 | 7.87 |
| 44634.46875 | 7.87 |
| 44634.479166666664 | 7.87 |
| 44634.489583333336 | 7.87 |
| 44634.5 | 7.87 |
| 44634.510416666664 | 7.86 |
| 44634.520833333336 | 7.86 |
| 44634.53125 | 7.86 |
| 44634.541666666664 | 7.85 |
| 44634.552083333336 | 7.86 |
| 44634.5625 | 7.85 |
| 44634.572916666664 | 7.85 |
| 44634.583333333336 | 7.85 |
| 44634.59375 | 7.84 |
| 44634.604166666664 | 7.76 |
| 44634.614583333336 | 7.76 |
| 44634.625 | 7.73 |
| 44634.635416666664 | 7.77 |
| 44634.645833333336 | 7.78 |
| 44634.65625 | 7.71 |
| 44634.666666666664 | 7.73 |
| 44634.677083333336 | 7.74 |
| 44634.6875 | 7.72 |
| 44634.697916666664 | 7.75 |
| 44634.708333333336 | 7.77 |
| 44634.71875 | 7.76 |
| 44634.729166666664 | 7.77 |
| 44634.739583333336 | 7.8 |
| 44634.75 | 7.81 |
| 44634.760416666664 | 7.82 |
| 44634.770833333336 | 7.83 |
| 44634.78125 | 7.87 |
| 44634.791666666664 | 7.88 |
| 44634.802083333336 | 7.88 |
| 44634.8125 | 7.88 |
| 44634.822916666664 | 7.9 |
| 44634.833333333336 | 7.91 |
| 44634.84375 | 7.91 |
| 44634.854166666664 | 7.92 |
| 44634.864583333336 | 7.93 |
| 44634.875 | 7.93 |
| 44634.885416666664 | 7.93 |
| 44634.895833333336 | 7.94 |
| 44634.90625 | 7.94 |
| 44634.916666666664 | 7.94 |
| 44634.927083333336 | 7.94 |
| 44634.9375 | 7.93 |
| 44634.947916666664 | 7.93 |
| 44634.958333333336 | 7.93 |
| 44634.96875 | 7.93 |
| 44634.979166666664 | 7.93 |
| 44634.989583333336 | 7.93 |
| 44635.0 | 7.93 |
| 44635.010416666664 | 7.93 |
| 44635.020833333336 | 7.93 |
| 44635.03125 | 7.93 |
| 44635.041666666664 | 7.93 |
| 44635.052083333336 | 7.92 |
| 44635.0625 | 7.93 |
| 44635.072916666664 | 7.92 |
| 44635.083333333336 | 7.92 |
| 44635.09375 | 7.91 |
| 44635.104166666664 | 7.9 |
| 44635.114583333336 | 7.89 |
| 44635.125 | 7.88 |
| 44635.135416666664 | 7.87 |
| 44635.145833333336 | 7.87 |
| 44635.15625 | 7.86 |
| 44635.166666666664 | 7.86 |
| 44635.177083333336 | 7.85 |
| 44635.1875 | 7.85 |
| 44635.197916666664 | 7.85 |
| 44635.208333333336 | 7.84 |
| 44635.21875 | 7.84 |
| 44635.229166666664 | 7.84 |
| 44635.239583333336 | 7.86 |
| 44635.25 | 7.86 |
| 44635.260416666664 | 7.87 |
| 44635.270833333336 | 7.88 |
| 44635.28125 | 7.88 |
| 44635.291666666664 | 7.88 |
| 44635.302083333336 | 7.88 |
| 44635.3125 | 7.88 |
| 44635.322916666664 | 7.88 |
| 44635.333333333336 | 7.88 |
| 44635.34375 | 7.88 |
| 44635.354166666664 | 7.87 |
| 44635.364583333336 | 7.86 |
| 44635.375 | 7.86 |
| 44635.385416666664 | 7.86 |
| 44635.395833333336 | 7.86 |
| 44635.40625 | 7.86 |
| 44635.416666666664 | 7.85 |
| 44635.427083333336 | 7.85 |
| 44635.4375 | 7.85 |
| 44635.447916666664 | 7.86 |
| 44635.458333333336 | 7.86 |
| 44635.46875 | 7.86 |
| 44635.479166666664 | 7.86 |
| 44635.489583333336 | 7.86 |
| 44635.5 | 7.85 |
| 44635.510416666664 | 7.86 |
| 44635.520833333336 | 7.86 |
| 44635.53125 | 7.86 |
| 44635.541666666664 | 7.85 |
| 44635.552083333336 | 7.86 |
| 44635.5625 | 7.86 |
| 44635.572916666664 | 7.86 |
| 44635.583333333336 | 7.85 |
| 44635.59375 | 7.85 |
| 44635.604166666664 | 7.85 |
| 44635.614583333336 | 7.85 |
| 44635.625 | 7.85 |
| 44635.635416666664 | 7.85 |
| 44635.645833333336 | 7.84 |
| 44635.65625 | 7.83 |
| 44635.666666666664 | 7.84 |
| 44635.677083333336 | 7.83 |
| 44635.6875 | 7.83 |
| 44635.697916666664 | 7.83 |
| 44635.708333333336 | 7.82 |
| 44635.71875 | 7.83 |
| 44635.729166666664 | 7.84 |
| 44635.739583333336 | 7.84 |
| 44635.75 | 7.84 |
| 44635.760416666664 | 7.84 |
| 44635.770833333336 | 7.85 |
| 44635.78125 | 7.85 |
| 44635.791666666664 | 7.86 |
| 44635.802083333336 | 7.88 |
| 44635.8125 | 7.89 |
| 44635.822916666664 | 7.9 |
| 44635.833333333336 | 7.91 |
| 44635.84375 | 7.92 |
| 44635.854166666664 | 7.92 |
| 44635.864583333336 | 7.92 |
| 44635.875 | 7.92 |
| 44635.885416666664 | 7.92 |
| 44635.895833333336 | 7.91 |
| 44635.90625 | 7.91 |
| 44635.916666666664 | 7.91 |
| 44635.927083333336 | 7.91 |
| 44635.9375 | 7.91 |
| 44635.947916666664 | 7.91 |
| 44635.958333333336 | 7.91 |
| 44635.96875 | 7.91 |
| 44635.979166666664 | 7.91 |
| 44635.989583333336 | 7.91 |
| 44636.0 | 7.91 |
| 44636.010416666664 | 7.91 |
| 44636.020833333336 | 7.91 |
| 44636.03125 | 7.91 |
| 44636.041666666664 | 7.91 |
| 44636.052083333336 | 7.9 |
| 44636.0625 | 7.9 |
| 44636.072916666664 | 7.89 |
| 44636.083333333336 | 7.89 |
| 44636.09375 | 7.88 |
| 44636.104166666664 | 7.89 |
| 44636.114583333336 | 7.89 |
| 44636.125 | 7.89 |
| 44636.135416666664 | 7.89 |
| 44636.145833333336 | 7.88 |
| 44636.15625 | 7.87 |
| 44636.166666666664 | 7.86 |
| 44636.177083333336 | 7.85 |
| 44636.1875 | 7.83 |
| 44636.197916666664 | 7.83 |
| 44636.208333333336 | 7.82 |
| 44636.21875 | 7.82 |
| 44636.229166666664 | 7.81 |
| 44636.239583333336 | 7.81 |
| 44636.25 | 7.81 |
| 44636.260416666664 | 7.81 |
| 44636.270833333336 | 7.81 |
| 44636.28125 | 7.81 |
| 44636.291666666664 | 7.81 |
| 44636.302083333336 | 7.82 |
| 44636.3125 | 7.83 |
| 44636.322916666664 | 7.84 |
| 44636.333333333336 | 7.85 |
| 44636.34375 | 7.85 |
| 44636.354166666664 | 7.85 |
| 44636.364583333336 | 7.84 |
| 44636.375 | 7.84 |
| 44636.385416666664 | 7.84 |
| 44636.395833333336 | 7.84 |
| 44636.40625 | 7.84 |
| 44636.416666666664 | 7.84 |
| 44636.427083333336 | 7.84 |
| 44636.4375 | 7.84 |
| 44636.447916666664 | 7.84 |
| 44636.458333333336 | 7.84 |
| 44636.46875 | 7.85 |
| 44636.479166666664 | 7.85 |
| 44636.489583333336 | 7.85 |
| 44636.5 | 7.85 |
| 44636.510416666664 | 7.85 |
| 44636.520833333336 | 7.85 |
| 44636.53125 | 7.85 |
| 44636.541666666664 | 7.85 |
| 44636.552083333336 | 7.85 |
| 44636.5625 | 7.85 |
| 44636.572916666664 | 7.84 |
| 44636.583333333336 | 7.85 |
| 44636.59375 | 7.85 |
| 44636.604166666664 | 7.84 |
| 44636.614583333336 | 7.82 |
| 44636.625 | 7.82 |
| 44636.635416666664 | 7.82 |
| 44636.645833333336 | 7.82 |
| 44636.65625 | 7.81 |
| 44636.666666666664 | 7.81 |
| 44636.677083333336 | 7.81 |
| 44636.6875 | 7.8 |
| 44636.697916666664 | 7.79 |
| 44636.708333333336 | 7.79 |
| 44636.71875 | 7.78 |
| 44636.729166666664 | 7.78 |
| 44636.739583333336 | 7.79 |
| 44636.75 | 7.78 |
| 44636.760416666664 | 7.79 |
| 44636.770833333336 | 7.79 |
| 44636.78125 | 7.79 |
| 44636.791666666664 | 7.8 |
| 44636.802083333336 | 7.8 |
| 44636.8125 | 7.8 |
| 44636.822916666664 | 7.81 |
| 44636.833333333336 | 7.82 |
| 44636.84375 | 7.83 |
| 44636.854166666664 | 7.85 |
| 44636.864583333336 | 7.87 |
| 44636.875 | 7.88 |
| 44636.885416666664 | 7.88 |
| 44636.895833333336 | 7.89 |
| 44636.90625 | 7.89 |
| 44636.916666666664 | 7.89 |
| 44636.927083333336 | 7.89 |
| 44636.9375 | 7.89 |
| 44636.947916666664 | 7.89 |
| 44636.958333333336 | 7.89 |
| 44636.96875 | 7.89 |
| 44636.979166666664 | 7.89 |
| 44636.989583333336 | 7.89 |
| 44637.0 | 7.89 |
| 44637.010416666664 | 7.89 |
| 44637.020833333336 | 7.89 |
| 44637.03125 | 7.89 |
| 44637.041666666664 | 7.89 |
| 44637.052083333336 | 7.89 |
| 44637.0625 | 7.88 |
| 44637.072916666664 | 7.88 |
| 44637.083333333336 | 7.88 |
| 44637.09375 | 7.88 |
| 44637.104166666664 | 7.87 |
| 44637.114583333336 | 7.86 |
| 44637.125 | 7.85 |
| 44637.135416666664 | 7.84 |
| 44637.145833333336 | 7.83 |
| 44637.15625 | 7.83 |
| 44637.166666666664 | 7.82 |
| 44637.177083333336 | 7.81 |
| 44637.1875 | 7.8 |
| 44637.197916666664 | 7.81 |
| 44637.208333333336 | 7.79 |
| 44637.21875 | 7.79 |
| 44637.229166666664 | 7.78 |
| 44637.239583333336 | 7.78 |
| 44637.25 | 7.77 |
| 44637.260416666664 | 7.77 |
| 44637.270833333336 | 7.76 |
| 44637.28125 | 7.76 |
| 44637.291666666664 | 7.76 |
| 44637.302083333336 | 7.76 |
| 44637.3125 | 7.76 |
| 44637.322916666664 | 7.76 |
| 44637.333333333336 | 7.77 |
| 44637.34375 | 7.79 |
| 44637.354166666664 | 7.8 |
| 44637.364583333336 | 7.8 |
| 44637.375 | 7.8 |
| 44637.385416666664 | 7.8 |
| 44637.395833333336 | 7.8 |
| 44637.40625 | 7.8 |
| 44637.416666666664 | 7.8 |
| 44637.427083333336 | 7.8 |
| 44637.4375 | 7.81 |
| 44637.447916666664 | 7.81 |
| 44637.458333333336 | 7.81 |
| 44637.46875 | 7.81 |
| 44637.479166666664 | 7.82 |
| 44637.489583333336 | 7.82 |
| 44637.5 | 7.83 |
| 44637.510416666664 | 7.83 |
| 44637.520833333336 | 7.83 |
| 44637.53125 | 7.84 |
| 44637.541666666664 | 7.84 |
| 44637.552083333336 | 7.83 |
| 44637.5625 | 7.83 |
| 44637.572916666664 | 7.84 |
| 44637.583333333336 | 7.84 |
| 44637.59375 | 7.83 |
| 44637.604166666664 | 7.83 |
| 44637.614583333336 | 7.81 |
| 44637.625 | 7.81 |
| 44637.635416666664 | 7.81 |
| 44637.645833333336 | 7.8 |
| 44637.65625 | 7.79 |
| 44637.666666666664 | 7.78 |
| 44637.677083333336 | 7.78 |
| 44637.6875 | 7.79 |
| 44637.697916666664 | 7.78 |
| 44637.708333333336 | 7.79 |
| 44637.71875 | 7.78 |
| 44637.729166666664 | 7.79 |
| 44637.739583333336 | 7.8 |
| 44637.75 | 7.79 |
| 44637.760416666664 | 7.79 |
| 44637.770833333336 | 7.78 |
| 44637.78125 | 7.78 |
| 44637.791666666664 | 7.77 |
| 44637.802083333336 | 7.78 |
| 44637.8125 | 7.78 |
| 44637.822916666664 | 7.77 |
| 44637.833333333336 | 7.77 |
| 44637.84375 | 7.76 |
| 44637.854166666664 | 7.78 |
| 44637.864583333336 | 7.78 |
| 44637.875 | 7.8 |
| 44637.885416666664 | 7.82 |
| 44637.895833333336 | 7.83 |
| 44637.90625 | 7.84 |
| 44637.916666666664 | 7.83 |
| 44637.927083333336 | 7.83 |
| 44637.9375 | 7.83 |
| 44637.947916666664 | 7.84 |
| 44637.958333333336 | 7.84 |
| 44637.96875 | 7.84 |
| 44637.979166666664 | 7.84 |
| 44637.989583333336 | 7.84 |
| 44638.0 | 7.84 |
| 44638.010416666664 | 7.85 |
| 44638.020833333336 | 7.85 |
| 44638.03125 | 7.85 |
| 44638.041666666664 | 7.85 |
| 44638.052083333336 | 7.85 |
| 44638.0625 | 7.85 |
| 44638.072916666664 | 7.85 |
| 44638.083333333336 | 7.85 |
| 44638.09375 | 7.85 |
| 44638.104166666664 | 7.84 |
| 44638.114583333336 | 7.83 |
| 44638.125 | 7.82 |
| 44638.135416666664 | 7.81 |
| 44638.145833333336 | 7.79 |
| 44638.15625 | 7.76 |
| 44638.166666666664 | 7.77 |
| 44638.177083333336 | 7.76 |
| 44638.1875 | 7.72 |
| 44638.197916666664 | 7.73 |
| 44638.208333333336 | 7.74 |
| 44638.21875 | 7.74 |
| 44638.229166666664 | 7.73 |
| 44638.239583333336 | 7.71 |
| 44638.25 | 7.68 |
| 44638.260416666664 | 7.68 |
| 44638.270833333336 | 7.66 |
| 44638.28125 | 7.65 |
| 44638.291666666664 | 7.63 |
| 44638.302083333336 | 7.63 |
| 44638.3125 | 7.63 |
| 44638.322916666664 | 7.63 |
| 44638.333333333336 | 7.63 |
| 44638.34375 | 7.64 |
| 44638.354166666664 | 7.64 |
| 44638.364583333336 | 7.67 |
| 44638.375 | 7.69 |
| 44638.385416666664 | 7.71 |
| 44638.395833333336 | 7.72 |
| 44638.40625 | 7.73 |
| 44638.416666666664 | 7.73 |
| 44638.427083333336 | 7.73 |
| 44638.4375 | 7.73 |
| 44638.447916666664 | 7.73 |
| 44638.458333333336 | 7.74 |
| 44638.46875 | 7.75 |
| 44638.479166666664 | 7.76 |
| 44638.489583333336 | 7.77 |
| 44638.5 | 7.78 |
| 44638.510416666664 | 7.78 |
| 44638.520833333336 | 7.79 |
| 44638.53125 | 7.79 |
| 44638.541666666664 | 7.79 |
| 44638.552083333336 | 7.79 |
| 44638.5625 | 7.79 |
| 44638.572916666664 | 7.8 |
| 44638.583333333336 | 7.8 |
| 44638.59375 | 7.79 |
| 44638.604166666664 | 7.79 |
| 44638.614583333336 | 7.8 |
| 44638.625 | 7.8 |
| 44638.635416666664 | 7.78 |
| 44638.645833333336 | 7.77 |
| 44638.65625 | 7.75 |
| 44638.666666666664 | 7.73 |
| 44638.677083333336 | 7.72 |
| 44638.6875 | 7.72 |
| 44638.697916666664 | 7.73 |
| 44638.708333333336 | 7.74 |
| 44638.71875 | 7.73 |
| 44638.729166666664 | 7.73 |
| 44638.739583333336 | 7.73 |
| 44638.75 | 7.71 |
| 44638.760416666664 | 7.71 |
| 44638.770833333336 | 7.7 |
| 44638.78125 | 7.7 |
| 44638.791666666664 | 7.7 |
| 44638.802083333336 | 7.7 |
| 44638.8125 | 7.7 |
| 44638.822916666664 | 7.7 |
| 44638.833333333336 | 7.71 |
| 44638.84375 | 7.7 |
| 44638.854166666664 | 7.7 |
| 44638.864583333336 | 7.69 |
| 44638.875 | 7.71 |
| 44638.885416666664 | 7.74 |
| 44638.895833333336 | 7.76 |
| 44638.90625 | 7.78 |
| 44638.916666666664 | 7.8 |
| 44638.927083333336 | 7.81 |
| 44638.9375 | 7.82 |
| 44638.947916666664 | 7.82 |
| 44638.958333333336 | 7.82 |
| 44638.96875 | 7.82 |
| 44638.979166666664 | 7.82 |
| 44638.989583333336 | 7.82 |
| 44639.0 | 7.82 |
| 44639.010416666664 | 7.82 |
| 44639.020833333336 | 7.82 |
| 44639.03125 | 7.82 |
| 44639.041666666664 | 7.82 |
| 44639.052083333336 | 7.81 |
| 44639.0625 | 7.81 |
| 44639.072916666664 | 7.81 |
| 44639.083333333336 | 7.81 |
| 44639.09375 | 7.81 |
| 44639.104166666664 | 7.8 |
| 44639.114583333336 | 7.8 |
| 44639.125 | 7.81 |
| 44639.135416666664 | 7.8 |
| 44639.145833333336 | 7.8 |
| 44639.15625 | 7.79 |
| 44639.166666666664 | 7.77 |
| 44639.177083333336 | 7.77 |
| 44639.1875 | 7.76 |
| 44639.197916666664 | 7.74 |
| 44639.208333333336 | 7.72 |
| 44639.21875 | 7.72 |
| 44639.229166666664 | 7.71 |
| 44639.239583333336 | 7.7 |
| 44639.25 | 7.7 |
| 44639.260416666664 | 7.71 |
| 44639.270833333336 | 7.71 |
| 44639.28125 | 7.68 |
| 44639.291666666664 | 7.65 |
| 44639.302083333336 | 7.64 |
| 44639.3125 | 7.61 |
| 44639.322916666664 | 7.6 |
| 44639.333333333336 | 7.6 |
| 44639.34375 | 7.61 |
| 44639.354166666664 | 7.61 |
| 44639.364583333336 | 7.61 |
| 44639.375 | 7.62 |
| 44639.385416666664 | 7.64 |
| 44639.395833333336 | 7.66 |
| 44639.40625 | 7.68 |
| 44639.416666666664 | 7.69 |
| 44639.427083333336 | 7.69 |
| 44639.4375 | 7.69 |
| 44639.447916666664 | 7.7 |
| 44639.458333333336 | 7.7 |
| 44639.46875 | 7.7 |
| 44639.479166666664 | 7.71 |
| 44639.489583333336 | 7.71 |
| 44639.5 | 7.72 |
| 44639.510416666664 | 7.73 |
| 44639.520833333336 | 7.73 |
| 44639.53125 | 7.74 |
| 44639.541666666664 | 7.74 |
| 44639.552083333336 | 7.75 |
| 44639.5625 | 7.75 |
| 44639.572916666664 | 7.75 |
| 44639.583333333336 | 7.75 |
| 44639.59375 | 7.75 |
| 44639.604166666664 | 7.75 |
| 44639.614583333336 | 7.74 |
| 44639.625 | 7.75 |
| 44639.635416666664 | 7.76 |
| 44639.645833333336 | 7.76 |
| 44639.65625 | 7.76 |
| 44639.666666666664 | 7.76 |
| 44639.677083333336 | 7.76 |
| 44639.6875 | 7.76 |
| 44639.697916666664 | 7.74 |
| 44639.708333333336 | 7.74 |
| 44639.71875 | 7.75 |
| 44639.729166666664 | 7.75 |
| 44639.739583333336 | 7.76 |
| 44639.75 | 7.76 |
| 44639.760416666664 | 7.75 |
| 44639.770833333336 | 7.75 |
| 44639.78125 | 7.74 |
| 44639.791666666664 | 7.74 |
| 44639.802083333336 | 7.73 |
| 44639.8125 | 7.73 |
| 44639.822916666664 | 7.73 |
| 44639.833333333336 | 7.73 |
| 44639.84375 | 7.73 |
| 44639.854166666664 | 7.73 |
| 44639.864583333336 | 7.73 |
| 44639.875 | 7.72 |
| 44639.885416666664 | 7.71 |
| 44639.895833333336 | 7.73 |
| 44639.90625 | 7.75 |
| 44639.916666666664 | 7.77 |
| 44639.927083333336 | 7.79 |
| 44639.9375 | 7.8 |
| 44639.947916666664 | 7.8 |
| 44639.958333333336 | 7.81 |
| 44639.96875 | 7.8 |
| 44639.979166666664 | 7.8 |
| 44639.989583333336 | 7.79 |
| 44640.0 | 7.79 |
| 44640.010416666664 | 7.79 |
| 44640.020833333336 | 7.79 |
| 44640.03125 | 7.79 |
| 44640.041666666664 | 7.79 |
| 44640.052083333336 | 7.79 |
| 44640.0625 | 7.79 |
| 44640.072916666664 | 7.78 |
| 44640.083333333336 | 7.78 |
| 44640.09375 | 7.78 |
| 44640.104166666664 | 7.78 |
| 44640.114583333336 | 7.78 |
| 44640.125 | 7.78 |
| 44640.135416666664 | 7.77 |
| 44640.145833333336 | 7.78 |
| 44640.15625 | 7.77 |
| 44640.166666666664 | 7.77 |
| 44640.177083333336 | 7.76 |
| 44640.1875 | 7.75 |
| 44640.197916666664 | 7.75 |
| 44640.208333333336 | 7.74 |
| 44640.21875 | 7.72 |
| 44640.229166666664 | 7.7 |
| 44640.239583333336 | 7.67 |
| 44640.25 | 7.68 |
| 44640.260416666664 | 7.71 |
| 44640.270833333336 | 7.72 |
| 44640.28125 | 7.7 |
| 44640.291666666664 | 7.68 |
| 44640.302083333336 | 7.67 |
| 44640.3125 | 7.65 |
| 44640.322916666664 | 7.64 |
| 44640.333333333336 | 7.62 |
| 44640.34375 | 7.61 |
| 44640.354166666664 | 7.6 |
| 44640.364583333336 | 7.59 |
| 44640.375 | 7.6 |
| 44640.385416666664 | 7.6 |
| 44640.395833333336 | 7.6 |
| 44640.40625 | 7.61 |
| 44640.416666666664 | 7.62 |
| 44640.427083333336 | 7.63 |
| 44640.4375 | 7.66 |
| 44640.447916666664 | 7.66 |
| 44640.458333333336 | 7.66 |
| 44640.46875 | 7.66 |
| 44640.479166666664 | 7.66 |
| 44640.489583333336 | 7.67 |
| 44640.5 | 7.67 |
| 44640.510416666664 | 7.67 |
| 44640.520833333336 | 7.68 |
| 44640.53125 | 7.69 |
| 44640.541666666664 | 7.7 |
| 44640.552083333336 | 7.71 |
| 44640.5625 | 7.72 |
| 44640.572916666664 | 7.73 |
| 44640.583333333336 | 7.73 |
| 44640.59375 | 7.74 |
| 44640.604166666664 | 7.74 |
| 44640.614583333336 | 7.75 |
| 44640.625 | 7.75 |
| 44640.635416666664 | 7.75 |
| 44640.645833333336 | 7.75 |
| 44640.65625 | 7.76 |
| 44640.666666666664 | 7.76 |
| 44640.677083333336 | 7.76 |
| 44640.6875 | 7.77 |
| 44640.697916666664 | 7.76 |
| 44640.708333333336 | 7.76 |
| 44640.71875 | 7.77 |
| 44640.729166666664 | 7.76 |
| 44640.739583333336 | 7.77 |
| 44640.75 | 7.76 |
| 44640.760416666664 | 7.76 |
| 44640.770833333336 | 7.76 |
| 44640.78125 | 7.77 |
| 44640.791666666664 | 7.76 |
| 44640.802083333336 | 7.76 |
| 44640.8125 | 7.75 |
| 44640.822916666664 | 7.75 |
| 44640.833333333336 | 7.74 |
| 44640.84375 | 7.74 |
| 44640.854166666664 | 7.74 |
| 44640.864583333336 | 7.74 |
| 44640.875 | 7.74 |
| 44640.885416666664 | 7.73 |
| 44640.895833333336 | 7.74 |
| 44640.90625 | 7.73 |
| 44640.916666666664 | 7.72 |
| 44640.927083333336 | 7.72 |
| 44640.9375 | 7.75 |
| 44640.947916666664 | 7.79 |
| 44640.958333333336 | 7.8 |
| 44640.96875 | 7.81 |
| 44640.979166666664 | 7.81 |
| 44640.989583333336 | 7.82 |
| 44641.0 | 7.82 |
| 44641.010416666664 | 7.81 |
| 44641.020833333336 | 7.81 |
| 44641.03125 | 7.81 |
| 44641.041666666664 | 7.81 |
| 44641.052083333336 | 7.8 |
| 44641.0625 | 7.8 |
| 44641.072916666664 | 7.8 |
| 44641.083333333336 | 7.8 |
| 44641.09375 | 7.81 |
| 44641.104166666664 | 7.81 |
| 44641.114583333336 | 7.81 |
| 44641.125 | 7.81 |
| 44641.135416666664 | 7.81 |
| 44641.145833333336 | 7.81 |
| 44641.15625 | 7.81 |
| 44641.166666666664 | 7.8 |
| 44641.177083333336 | 7.81 |
| 44641.1875 | 7.81 |
| 44641.197916666664 | 7.8 |
| 44641.208333333336 | 7.79 |
| 44641.21875 | 7.79 |
| 44641.229166666664 | 7.78 |
| 44641.239583333336 | 7.78 |
| 44641.25 | 7.76 |
| 44641.260416666664 | 7.73 |
| 44641.270833333336 | 7.73 |
| 44641.28125 | 7.73 |
| 44641.291666666664 | 7.75 |
| 44641.302083333336 | 7.77 |
| 44641.3125 | 7.77 |
| 44641.322916666664 | 7.76 |
| 44641.333333333336 | 7.75 |
| 44641.34375 | 7.75 |
| 44641.354166666664 | 7.74 |
| 44641.364583333336 | 7.72 |
| 44641.375 | 7.72 |
| 44641.385416666664 | 7.72 |
| 44641.395833333336 | 7.72 |
| 44641.40625 | 7.73 |
| 44641.416666666664 | 7.72 |
| 44641.427083333336 | 7.72 |
| 44641.4375 | 7.72 |
| 44641.447916666664 | 7.72 |
| 44641.458333333336 | 7.73 |
| 44641.46875 | 7.74 |
| 44641.479166666664 | 7.74 |
| 44641.489583333336 | 7.74 |
| 44641.5 | 7.74 |
| 44641.510416666664 | 7.74 |
| 44641.520833333336 | 7.74 |
| 44641.53125 | 7.74 |
| 44641.541666666664 | 7.74 |
| 44641.552083333336 | 7.75 |
| 44641.5625 | 7.75 |
| 44641.572916666664 | 7.76 |
| 44641.583333333336 | 7.77 |
| 44641.59375 | 7.78 |
| 44641.604166666664 | 7.8 |
| 44641.614583333336 | 7.81 |
| 44641.625 | 7.81 |
| 44641.635416666664 | 7.82 |
| 44641.645833333336 | 7.82 |
| 44641.65625 | 7.82 |
| 44641.666666666664 | 7.82 |
| 44641.677083333336 | 7.82 |
| 44641.6875 | 7.83 |
| 44641.697916666664 | 7.83 |
| 44641.708333333336 | 7.83 |
| 44641.71875 | 7.83 |
| 44641.729166666664 | 7.84 |
| 44641.739583333336 | 7.84 |
| 44641.75 | 7.85 |
| 44641.760416666664 | 7.84 |
| 44641.770833333336 | 7.84 |
| 44641.78125 | 7.84 |
| 44641.791666666664 | 7.84 |
| 44641.802083333336 | 7.84 |
| 44641.8125 | 7.84 |
| 44641.822916666664 | 7.84 |
| 44641.833333333336 | 7.85 |
| 44641.84375 | 7.84 |
| 44641.854166666664 | 7.84 |
| 44641.864583333336 | 7.84 |
| 44641.875 | 7.84 |
| 44641.885416666664 | 7.84 |
| 44641.895833333336 | 7.84 |
| 44641.90625 | 7.84 |
| 44641.916666666664 | 7.84 |
| 44641.927083333336 | 7.83 |
| 44641.9375 | 7.82 |
| 44641.947916666664 | 7.82 |
| 44641.958333333336 | 7.83 |
| 44641.96875 | 7.86 |
| 44641.979166666664 | 7.87 |
| 44641.989583333336 | 7.88 |
| 44642.0 | 7.89 |
| 44642.010416666664 | 7.88 |
| 44642.020833333336 | 7.88 |
| 44642.03125 | 7.87 |
| 44642.041666666664 | 7.86 |
| 44642.052083333336 | 7.86 |
| 44642.0625 | 7.85 |
| 44642.072916666664 | 7.85 |
| 44642.083333333336 | 7.84 |
| 44642.09375 | 7.84 |
| 44642.104166666664 | 7.84 |
| 44642.114583333336 | 7.84 |
| 44642.125 | 7.84 |
| 44642.135416666664 | 7.84 |
| 44642.145833333336 | 7.84 |
| 44642.15625 | 7.84 |
| 44642.166666666664 | 7.84 |
| 44642.177083333336 | 7.84 |
| 44642.1875 | 7.84 |
| 44642.197916666664 | 7.84 |
| 44642.208333333336 | 7.84 |
| 44642.21875 | 7.83 |
| 44642.229166666664 | 7.82 |
| 44642.239583333336 | 7.81 |
| 44642.25 | 7.8 |
| 44642.260416666664 | 7.79 |
| 44642.270833333336 | 7.78 |
| 44642.28125 | 7.76 |
| 44642.291666666664 | 7.75 |
| 44642.302083333336 | 7.75 |
| 44642.3125 | 7.76 |
| 44642.322916666664 | 7.79 |
| 44642.333333333336 | 7.8 |
| 44642.34375 | 7.79 |
| 44642.354166666664 | 7.78 |
| 44642.364583333336 | 7.78 |
| 44642.375 | 7.78 |
| 44642.385416666664 | 7.76 |
| 44642.395833333336 | 7.75 |
| 44642.40625 | 7.74 |
| 44642.416666666664 | 7.73 |
| 44642.427083333336 | 7.73 |
| 44642.4375 | 7.73 |
| 44642.447916666664 | 7.73 |
| 44642.458333333336 | 7.73 |
| 44642.46875 | 7.73 |
| 44642.479166666664 | 7.74 |
| 44642.489583333336 | 7.74 |
| 44642.5 | 7.75 |
| 44642.510416666664 | 7.75 |
| 44642.520833333336 | 7.76 |
| 44642.53125 | 7.76 |
| 44642.541666666664 | 7.76 |
| 44642.552083333336 | 7.76 |
| 44642.5625 | 7.76 |
| 44642.572916666664 | 7.76 |
| 44642.583333333336 | 7.76 |
| 44642.59375 | 7.77 |
| 44642.604166666664 | 7.77 |
| 44642.614583333336 | 7.78 |
| 44642.625 | 7.79 |
| 44642.635416666664 | 7.8 |
| 44642.645833333336 | 7.81 |
| 44642.65625 | 7.81 |
| 44642.666666666664 | 7.81 |
| 44642.677083333336 | 7.82 |
| 44642.6875 | 7.82 |
| 44642.697916666664 | 7.81 |
| 44642.708333333336 | 7.81 |
| 44642.71875 | 7.83 |
| 44642.729166666664 | 7.85 |
| 44642.739583333336 | 7.84 |
| 44642.75 | 7.85 |
| 44642.760416666664 | 7.85 |
| 44642.770833333336 | 7.86 |
| 44642.78125 | 7.85 |
| 44642.791666666664 | 7.85 |
| 44642.802083333336 | 7.85 |
| 44642.8125 | 7.85 |
| 44642.822916666664 | 7.86 |
| 44642.833333333336 | 7.86 |
| 44642.84375 | 7.86 |
| 44642.854166666664 | 7.87 |
| 44642.864583333336 | 7.87 |
| 44642.875 | 7.87 |
| 44642.885416666664 | 7.86 |
| 44642.895833333336 | 7.85 |
| 44642.90625 | 7.85 |
| 44642.916666666664 | 7.85 |
| 44642.927083333336 | 7.85 |
| 44642.9375 | 7.84 |
| 44642.947916666664 | 7.84 |
| 44642.958333333336 | 7.83 |
| 44642.96875 | 7.83 |
| 44642.979166666664 | 7.82 |
| 44642.989583333336 | 7.82 |
| 44643.0 | 7.84 |
| 44643.010416666664 | 7.85 |
| 44643.020833333336 | 7.86 |
| 44643.03125 | 7.87 |
| 44643.041666666664 | 7.87 |
| 44643.052083333336 | 7.87 |
| 44643.0625 | 7.87 |
| 44643.072916666664 | 7.86 |
| 44643.083333333336 | 7.86 |
| 44643.09375 | 7.86 |
| 44643.104166666664 | 7.85 |
| 44643.114583333336 | 7.85 |
| 44643.125 | 7.84 |
| 44643.135416666664 | 7.84 |
| 44643.145833333336 | 7.84 |
| 44643.15625 | 7.83 |
| 44643.166666666664 | 7.83 |
| 44643.177083333336 | 7.83 |
| 44643.1875 | 7.83 |
| 44643.197916666664 | 7.83 |
| 44643.208333333336 | 7.83 |
| 44643.21875 | 7.83 |
| 44643.229166666664 | 7.83 |
| 44643.239583333336 | 7.83 |
| 44643.25 | 7.83 |
| 44643.260416666664 | 7.82 |
| 44643.270833333336 | 7.82 |
| 44643.28125 | 7.81 |
| 44643.291666666664 | 7.81 |
| 44643.302083333336 | 7.81 |
| 44643.3125 | 7.78 |
| 44643.322916666664 | 7.76 |
| 44643.333333333336 | 7.74 |
| 44643.34375 | 7.74 |
| 44643.354166666664 | 7.77 |
| 44643.364583333336 | 7.79 |
| 44643.375 | 7.8 |
| 44643.385416666664 | 7.78 |
| 44643.395833333336 | 7.76 |
| 44643.40625 | 7.76 |
| 44643.416666666664 | 7.76 |
| 44643.427083333336 | 7.76 |
| 44643.4375 | 7.75 |
| 44643.447916666664 | 7.74 |
| 44643.458333333336 | 7.73 |
| 44643.46875 | 7.73 |
| 44643.479166666664 | 7.73 |
| 44643.489583333336 | 7.74 |
| 44643.5 | 7.73 |
| 44643.510416666664 | 7.73 |
| 44643.520833333336 | 7.74 |
| 44643.53125 | 7.74 |
| 44643.541666666664 | 7.75 |
| 44643.552083333336 | 7.75 |
| 44643.5625 | 7.76 |
| 44643.572916666664 | 7.76 |
| 44643.583333333336 | 7.76 |
| 44643.59375 | 7.77 |
| 44643.604166666664 | 7.77 |
| 44643.614583333336 | 7.77 |
| 44643.625 | 7.78 |
| 44643.635416666664 | 7.78 |
| 44643.645833333336 | 7.79 |
| 44643.65625 | 7.79 |
| 44643.666666666664 | 7.79 |
| 44643.677083333336 | 7.79 |
| 44643.6875 | 7.8 |
| 44643.697916666664 | 7.8 |
| 44643.708333333336 | 7.81 |
| 44643.71875 | 7.81 |
| 44643.729166666664 | 7.81 |
| 44643.739583333336 | 7.82 |
| 44643.75 | 7.82 |
| 44643.760416666664 | 7.82 |
| 44643.770833333336 | 7.83 |
| 44643.78125 | 7.83 |
| 44643.791666666664 | 7.83 |
| 44643.802083333336 | 7.82 |
| 44643.8125 | 7.83 |
| 44643.822916666664 | 7.83 |
| 44643.833333333336 | 7.83 |
| 44643.84375 | 7.84 |
| 44643.854166666664 | 7.85 |
| 44643.864583333336 | 7.85 |
| 44643.875 | 7.85 |
| 44643.885416666664 | 7.85 |
| 44643.895833333336 | 7.84 |
| 44643.90625 | 7.84 |
| 44643.916666666664 | 7.84 |
| 44643.927083333336 | 7.84 |
| 44643.9375 | 7.84 |
| 44643.947916666664 | 7.83 |
| 44643.958333333336 | 7.83 |
| 44643.96875 | 7.83 |
| 44643.979166666664 | 7.83 |
| 44643.989583333336 | 7.82 |
| 44644.0 | 7.82 |
| 44644.010416666664 | 7.82 |
| 44644.020833333336 | 7.83 |
| 44644.03125 | 7.84 |
| 44644.041666666664 | 7.84 |
| 44644.052083333336 | 7.83 |
| 44644.0625 | 7.82 |
| 44644.072916666664 | 7.82 |
| 44644.083333333336 | 7.82 |
| 44644.09375 | 7.82 |
| 44644.104166666664 | 7.82 |
| 44644.114583333336 | 7.81 |
| 44644.125 | 7.81 |
| 44644.135416666664 | 7.82 |
| 44644.145833333336 | 7.82 |
| 44644.15625 | 7.82 |
| 44644.166666666664 | 7.82 |
| 44644.177083333336 | 7.82 |
| 44644.1875 | 7.82 |
| 44644.197916666664 | 7.82 |
| 44644.208333333336 | 7.82 |
| 44644.21875 | 7.82 |
| 44644.229166666664 | 7.82 |
| 44644.239583333336 | 7.82 |
| 44644.25 | 7.81 |
| 44644.260416666664 | 7.81 |
| 44644.270833333336 | 7.81 |
| 44644.28125 | 7.81 |
| 44644.291666666664 | 7.81 |
| 44644.302083333336 | 7.81 |
| 44644.3125 | 7.8 |
| 44644.322916666664 | 7.79 |
| 44644.333333333336 | 7.78 |
| 44644.34375 | 7.78 |
| 44644.354166666664 | 7.77 |
| 44644.364583333336 | 7.76 |
| 44644.375 | 7.75 |
| 44644.385416666664 | 7.74 |
| 44644.395833333336 | 7.73 |
| 44644.40625 | 7.7 |
| 44644.416666666664 | 7.69 |
| 44644.427083333336 | 7.69 |
| 44644.4375 | 7.71 |
| 44644.447916666664 | 7.72 |
| 44644.458333333336 | 7.74 |
| 44644.46875 | 7.75 |
| 44644.479166666664 | 7.75 |
| 44644.489583333336 | 7.75 |
| 44644.5 | 7.74 |
| 44644.510416666664 | 7.73 |
| 44644.520833333336 | 7.71 |
| 44644.53125 | 7.73 |
| 44644.541666666664 | 7.77 |
| 44644.552083333336 | 7.74 |
| 44644.5625 | 7.77 |
| 44644.572916666664 | 7.74 |
| 44644.583333333336 | 7.75 |
| 44644.59375 | 7.75 |
| 44644.604166666664 | 7.74 |
| 44644.614583333336 | 7.74 |
| 44644.625 | 7.73 |
| 44644.635416666664 | 7.73 |
| 44644.645833333336 | 7.74 |
| 44644.65625 | 7.74 |
| 44644.666666666664 | 7.74 |
| 44644.677083333336 | 7.76 |
| 44644.6875 | 7.77 |
| 44644.697916666664 | 7.76 |
| 44644.708333333336 | 7.77 |
| 44644.71875 | 7.76 |
| 44644.729166666664 | 7.77 |
| 44644.739583333336 | 7.76 |
| 44644.75 | 7.77 |
| 44644.760416666664 | 7.78 |
| 44644.770833333336 | 7.8 |
| 44644.78125 | 7.82 |
| 44644.791666666664 | 7.82 |
| 44644.802083333336 | 7.78 |
| 44644.8125 | 7.79 |
| 44644.822916666664 | 7.76 |
| 44644.833333333336 | 7.65 |
| 44644.84375 | 7.52 |
| 44644.854166666664 | 7.67 |
| 44644.864583333336 | 7.6 |
| 44644.875 | 7.46 |
| 44644.885416666664 | 7.47 |
| 44644.895833333336 | 7.41 |
| 44644.90625 | 7.38 |
| 44644.916666666664 | 7.35 |
| 44644.927083333336 | 7.27 |
| 44644.9375 | 7.24 |
| 44644.947916666664 | 7.19 |
| 44644.958333333336 | 7.11 |
| 44644.96875 | 7.08 |
| 44644.979166666664 | 7.07 |
| 44644.989583333336 | 7.05 |
| 44645.0 | 7.07 |
| 44645.010416666664 | 7.07 |
| 44645.020833333336 | 7.07 |
| 44645.03125 | 7.08 |
| 44645.041666666664 | 7.1 |
| 44645.052083333336 | 7.13 |
| 44645.0625 | 7.21 |
| 44645.072916666664 | 7.32 |
| 44645.083333333336 | 7.43 |
| 44645.09375 | 7.58 |
| 44645.104166666664 | 7.62 |
| 44645.114583333336 | 7.63 |
| 44645.125 | 7.63 |
| 44645.135416666664 | 7.63 |
| 44645.145833333336 | 7.64 |
| 44645.15625 | 7.65 |
| 44645.166666666664 | 7.67 |
| 44645.177083333336 | 7.67 |
| 44645.1875 | 7.68 |
| 44645.197916666664 | 7.69 |
| 44645.208333333336 | 7.69 |
| 44645.21875 | 7.69 |
| 44645.229166666664 | 7.69 |
| 44645.239583333336 | 7.7 |
| 44645.25 | 7.7 |
| 44645.260416666664 | 7.71 |
| 44645.270833333336 | 7.72 |
| 44645.28125 | 7.72 |
| 44645.291666666664 | 7.73 |
| 44645.302083333336 | 7.72 |
| 44645.3125 | 7.72 |
| 44645.322916666664 | 7.71 |
| 44645.333333333336 | 7.71 |
| 44645.34375 | 7.7 |
| 44645.354166666664 | 7.65 |
| 44645.364583333336 | 7.62 |
| 44645.375 | 7.6 |
| 44645.385416666664 | 7.53 |
| 44645.395833333336 | 7.52 |
| 44645.40625 | 7.5 |
| 44645.416666666664 | 7.46 |
| 44645.427083333336 | 7.42 |
| 44645.4375 | 7.36 |
| 44645.447916666664 | 7.3 |
| 44645.458333333336 | 7.28 |
| 44645.46875 | 7.22 |
| 44645.479166666664 | 7.18 |
| 44645.489583333336 | 7.15 |
| 44645.5 | 7.15 |
| 44645.510416666664 | 7.12 |
| 44645.520833333336 | 7.11 |
| 44645.53125 | 7.09 |
| 44645.541666666664 | 7.05 |
| 44645.552083333336 | 7.03 |
| 44645.5625 | 7.02 |
| 44645.572916666664 | 7.04 |
| 44645.583333333336 | 7.07 |
| 44645.59375 | 7.11 |
| 44645.604166666664 | 7.12 |
| 44645.614583333336 | 7.16 |
| 44645.625 | 7.16 |
| 44645.635416666664 | 7.2 |
| 44645.645833333336 | 7.21 |
| 44645.65625 | 7.25 |
| 44645.666666666664 | 7.29 |
| 44645.677083333336 | 7.3 |
| 44645.6875 | 7.49 |
| 44645.697916666664 | 7.52 |
| 44645.708333333336 | 7.58 |
| 44645.71875 | 7.6 |
| 44645.729166666664 | 7.6 |
| 44645.739583333336 | 7.62 |
| 44645.75 | 7.63 |
| 44645.760416666664 | 7.65 |
| 44645.770833333336 | 7.65 |
| 44645.78125 | 7.68 |
| 44645.791666666664 | 7.67 |
| 44645.802083333336 | 7.67 |
| 44645.8125 | 7.69 |
| 44645.822916666664 | 7.68 |
| 44645.833333333336 | 7.68 |
| 44645.84375 | 7.67 |
| 44645.854166666664 | 7.67 |
| 44645.864583333336 | 7.68 |
| 44645.875 | 7.68 |
| 44645.885416666664 | 7.63 |
| 44645.895833333336 | 7.55 |
| 44645.90625 | 7.61 |
| 44645.916666666664 | 7.67 |
| 44645.927083333336 | 7.56 |
| 44645.9375 | 7.49 |
| 44645.947916666664 | 7.46 |
| 44645.958333333336 | 7.44 |
| 44645.96875 | 7.42 |
| 44645.979166666664 | 7.4 |
| 44645.989583333336 | 7.37 |
| 44646.0 | 7.36 |
| 44646.010416666664 | 7.34 |
| 44646.020833333336 | 7.29 |
| 44646.03125 | 7.2 |
| 44646.041666666664 | 7.19 |
| 44646.052083333336 | 7.14 |
| 44646.0625 | 7.16 |
| 44646.072916666664 | 7.15 |
| 44646.083333333336 | 7.16 |
| 44646.09375 | 7.18 |
| 44646.104166666664 | 7.21 |
| 44646.114583333336 | 7.3 |
| 44646.125 | 7.35 |
| 44646.135416666664 | 7.42 |
| 44646.145833333336 | 7.5 |
| 44646.15625 | 7.53 |
| 44646.166666666664 | 7.54 |
| 44646.177083333336 | 7.55 |
| 44646.1875 | 7.6 |
| 44646.197916666664 | 7.62 |
| 44646.208333333336 | 7.65 |
| 44646.21875 | 7.65 |
| 44646.229166666664 | 7.65 |
| 44646.239583333336 | 7.65 |
| 44646.25 | 7.66 |
| 44646.260416666664 | 7.67 |
| 44646.270833333336 | 7.68 |
| 44646.28125 | 7.68 |
| 44646.291666666664 | 7.68 |
| 44646.302083333336 | 7.69 |
| 44646.3125 | 7.69 |
| 44646.322916666664 | 7.69 |
| 44646.333333333336 | 7.69 |
| 44646.34375 | 7.69 |
| 44646.354166666664 | 7.7 |
| 44646.364583333336 | 7.69 |
| 44646.375 | 7.7 |
| 44646.385416666664 | 7.69 |
| 44646.395833333336 | 7.68 |
| 44646.40625 | 7.67 |
| 44646.416666666664 | 7.63 |
| 44646.427083333336 | 7.58 |
| 44646.4375 | 7.51 |
| 44646.447916666664 | 7.48 |
| 44646.458333333336 | 7.47 |
| 44646.46875 | 7.45 |
| 44646.479166666664 | 7.4 |
| 44646.489583333336 | 7.38 |
| 44646.5 | 7.36 |
| 44646.510416666664 | 7.36 |
| 44646.520833333336 | 7.35 |
| 44646.53125 | 7.35 |
| 44646.541666666664 | 7.36 |
| 44646.552083333336 | 7.35 |
| 44646.5625 | 7.33 |
| 44646.572916666664 | 7.31 |
| 44646.583333333336 | 7.3 |
| 44646.59375 | 7.29 |
| 44646.604166666664 | 7.3 |
| 44646.614583333336 | 7.29 |
| 44646.625 | 7.31 |
| 44646.635416666664 | 7.31 |
| 44646.645833333336 | 7.33 |
| 44646.65625 | 7.34 |
| 44646.666666666664 | 7.34 |
| 44646.677083333336 | 7.38 |
| 44646.6875 | 7.49 |
| 44646.697916666664 | 7.56 |
| 44646.708333333336 | 7.61 |
| 44646.71875 | 7.63 |
| 44646.729166666664 | 7.64 |
| 44646.739583333336 | 7.65 |
| 44646.75 | 7.66 |
| 44646.760416666664 | 7.68 |
| 44646.770833333336 | 7.68 |
| 44646.78125 | 7.68 |
| 44646.791666666664 | 7.68 |
| 44646.802083333336 | 7.7 |
| 44646.8125 | 7.72 |
| 44646.822916666664 | 7.73 |
| 44646.833333333336 | 7.73 |
| 44646.84375 | 7.73 |
| 44646.854166666664 | 7.73 |
| 44646.864583333336 | 7.73 |
| 44646.875 | 7.74 |
| 44646.885416666664 | 7.74 |
| 44646.895833333336 | 7.74 |
| 44646.90625 | 7.73 |
| 44646.916666666664 | 7.74 |
| 44646.927083333336 | 7.73 |
| 44646.9375 | 7.73 |
| 44646.947916666664 | 7.72 |
| 44646.958333333336 | 7.71 |
| 44646.96875 | 7.69 |
| 44646.979166666664 | 7.68 |
| 44646.989583333336 | 7.66 |
| 44647.0 | 7.63 |
| 44647.010416666664 | 7.6 |
| 44647.020833333336 | 7.57 |
| 44647.03125 | 7.54 |
| 44647.041666666664 | 7.52 |
| 44647.052083333336 | 7.5 |
| 44647.0625 | 7.45 |
| 44647.072916666664 | 7.43 |
| 44647.083333333336 | 7.43 |
| 44647.09375 | 7.42 |
| 44647.104166666664 | 7.4 |
| 44647.114583333336 | 7.39 |
| 44647.125 | 7.41 |
| 44647.135416666664 | 7.41 |
| 44647.145833333336 | 7.43 |
| 44647.15625 | 7.48 |
| 44647.166666666664 | 7.5 |
| 44647.177083333336 | 7.61 |
| 44647.1875 | 7.63 |
| 44647.197916666664 | 7.65 |
| 44647.208333333336 | 7.65 |
| 44647.21875 | 7.65 |
| 44647.229166666664 | 7.66 |
| 44647.239583333336 | 7.67 |
| 44647.25 | 7.68 |
| 44647.260416666664 | 7.68 |
| 44647.270833333336 | 7.68 |
| 44647.28125 | 7.69 |
| 44647.291666666664 | 7.69 |
| 44647.302083333336 | 7.7 |
| 44647.3125 | 7.71 |
| 44647.322916666664 | 7.72 |
| 44647.333333333336 | 7.73 |
| 44647.34375 | 7.74 |
| 44647.354166666664 | 7.74 |
| 44647.364583333336 | 7.75 |
| 44647.375 | 7.75 |
| 44647.385416666664 | 7.75 |
| 44647.395833333336 | 7.75 |
| 44647.40625 | 7.75 |
| 44647.416666666664 | 7.75 |
| 44647.427083333336 | 7.75 |
| 44647.4375 | 7.75 |
| 44647.447916666664 | 7.75 |
| 44647.458333333336 | 7.73 |
| 44647.46875 | 7.72 |
| 44647.479166666664 | 7.68 |
| 44647.489583333336 | 7.69 |
| 44647.5 | 7.61 |
| 44647.510416666664 | 7.62 |
| 44647.520833333336 | 7.63 |
| 44647.53125 | 7.63 |
| 44647.541666666664 | 7.65 |
| 44647.552083333336 | 7.64 |
| 44647.5625 | 7.63 |
| 44647.572916666664 | 7.61 |
| 44647.583333333336 | 7.59 |
| 44647.59375 | 7.58 |
| 44647.604166666664 | 7.56 |
| 44647.614583333336 | 7.53 |
| 44647.625 | 7.53 |
| 44647.635416666664 | 7.5 |
| 44647.645833333336 | 7.51 |
| 44647.65625 | 7.51 |
| 44647.666666666664 | 7.51 |
| 44647.677083333336 | 7.52 |
| 44647.6875 | 7.53 |
| 44647.697916666664 | 7.55 |
| 44647.708333333336 | 7.61 |
| 44647.71875 | 7.66 |
| 44647.729166666664 | 7.68 |
| 44647.739583333336 | 7.7 |
| 44647.75 | 7.71 |
| 44647.760416666664 | 7.73 |
| 44647.770833333336 | 7.75 |
| 44647.78125 | 7.77 |
| 44647.791666666664 | 7.78 |
| 44647.802083333336 | 7.78 |
| 44647.8125 | 7.79 |
| 44647.822916666664 | 7.79 |
| 44647.833333333336 | 7.79 |
| 44647.84375 | 7.79 |
| 44647.854166666664 | 7.79 |
| 44647.864583333336 | 7.79 |
| 44647.875 | 7.8 |
| 44647.885416666664 | 7.8 |
| 44647.895833333336 | 7.81 |
| 44647.90625 | 7.81 |
| 44647.916666666664 | 7.81 |
| 44647.927083333336 | 7.81 |
| 44647.9375 | 7.81 |
| 44647.947916666664 | 7.81 |
| 44647.958333333336 | 7.82 |
| 44647.96875 | 7.82 |
| 44647.979166666664 | 7.82 |
| 44647.989583333336 | 7.79 |
| 44648.0 | 7.79 |
| 44648.010416666664 | 7.79 |
| 44648.020833333336 | 7.79 |
| 44648.03125 | 7.79 |
| 44648.041666666664 | 7.79 |
| 44648.052083333336 | 7.78 |
| 44648.0625 | 7.75 |
| 44648.072916666664 | 7.73 |
| 44648.083333333336 | 7.7 |
| 44648.09375 | 7.67 |
| 44648.104166666664 | 7.66 |
| 44648.114583333336 | 7.63 |
| 44648.125 | 7.6 |
| 44648.135416666664 | 7.59 |
| 44648.145833333336 | 7.59 |
| 44648.15625 | 7.59 |
| 44648.166666666664 | 7.6 |
| 44648.177083333336 | 7.6 |
| 44648.1875 | 7.6 |
| 44648.197916666664 | 7.6 |
| 44648.208333333336 | 7.61 |
| 44648.21875 | 7.67 |
| 44648.229166666664 | 7.73 |
| 44648.239583333336 | 7.75 |
| 44648.25 | 7.76 |
| 44648.260416666664 | 7.77 |
| 44648.270833333336 | 7.77 |
| 44648.28125 | 7.76 |
| 44648.291666666664 | 7.76 |
| 44648.302083333336 | 7.77 |
| 44648.3125 | 7.77 |
| 44648.322916666664 | 7.78 |
| 44648.333333333336 | 7.79 |
| 44648.34375 | 7.8 |
| 44648.354166666664 | 7.8 |
| 44648.364583333336 | 7.8 |
| 44648.375 | 7.81 |
| 44648.385416666664 | 7.81 |
| 44648.395833333336 | 7.81 |
| 44648.40625 | 7.81 |
| 44648.416666666664 | 7.81 |
| 44648.427083333336 | 7.81 |
| 44648.4375 | 7.81 |
| 44648.447916666664 | 7.81 |
| 44648.458333333336 | 7.81 |
| 44648.46875 | 7.81 |
| 44648.479166666664 | 7.82 |
| 44648.489583333336 | 7.82 |
| 44648.5 | 7.82 |
| 44648.510416666664 | 7.81 |
| 44648.520833333336 | 7.8 |
| 44648.53125 | 7.81 |
| 44648.541666666664 | 7.79 |
| 44648.552083333336 | 7.77 |
| 44648.5625 | 7.76 |
| 44648.572916666664 | 7.77 |
| 44648.583333333336 | 7.75 |
| 44648.59375 | 7.76 |
| 44648.604166666664 | 7.76 |
| 44648.614583333336 | 7.75 |
| 44648.625 | 7.73 |
| 44648.635416666664 | 7.72 |
| 44648.645833333336 | 7.71 |
| 44648.65625 | 7.72 |
| 44648.666666666664 | 7.7 |
| 44648.677083333336 | 7.71 |
| 44648.6875 | 7.71 |
| 44648.697916666664 | 7.71 |
| 44648.708333333336 | 7.72 |
| 44648.71875 | 7.72 |
| 44648.729166666664 | 7.71 |
| 44648.739583333336 | 7.73 |
| 44648.75 | 7.76 |
| 44648.760416666664 | 7.78 |
| 44648.770833333336 | 7.8 |
| 44648.78125 | 7.83 |
| 44648.791666666664 | 7.84 |
| 44648.802083333336 | 7.85 |
| 44648.8125 | 7.85 |
| 44648.822916666664 | 7.86 |
| 44648.833333333336 | 7.86 |
| 44648.84375 | 7.87 |
| 44648.854166666664 | 7.87 |
| 44648.864583333336 | 7.87 |
| 44648.875 | 7.87 |
| 44648.885416666664 | 7.87 |
| 44648.895833333336 | 7.88 |
| 44648.90625 | 7.88 |
| 44648.916666666664 | 7.89 |
| 44648.927083333336 | 7.89 |
| 44648.9375 | 7.89 |
| 44648.947916666664 | 7.89 |
| 44648.958333333336 | 7.89 |
| 44648.96875 | 7.89 |
| 44648.979166666664 | 7.89 |
| 44648.989583333336 | 7.89 |
| 44649.0 | 7.88 |
| 44649.010416666664 | 7.88 |
| 44649.020833333336 | 7.88 |
| 44649.03125 | 7.87 |
| 44649.041666666664 | 7.87 |
| 44649.052083333336 | 7.87 |
| 44649.0625 | 7.86 |
| 44649.072916666664 | 7.83 |
| 44649.083333333336 | 7.81 |
| 44649.09375 | 7.79 |
| 44649.104166666664 | 7.78 |
| 44649.114583333336 | 7.76 |
| 44649.125 | 7.75 |
| 44649.135416666664 | 7.73 |
| 44649.145833333336 | 7.74 |
| 44649.15625 | 7.74 |
| 44649.166666666664 | 7.74 |
| 44649.177083333336 | 7.75 |
| 44649.1875 | 7.74 |
| 44649.197916666664 | 7.74 |
| 44649.208333333336 | 7.74 |
| 44649.21875 | 7.74 |
| 44649.229166666664 | 7.74 |
| 44649.239583333336 | 7.74 |
| 44649.25 | 7.8 |
| 44649.260416666664 | 7.82 |
| 44649.270833333336 | 7.83 |
| 44649.28125 | 7.84 |
| 44649.291666666664 | 7.85 |
| 44649.302083333336 | 7.85 |
| 44649.3125 | 7.84 |
| 44649.322916666664 | 7.84 |
| 44649.333333333336 | 7.84 |
| 44649.34375 | 7.85 |
| 44649.354166666664 | 7.85 |
| 44649.364583333336 | 7.86 |
| 44649.375 | 7.86 |
| 44649.385416666664 | 7.87 |
| 44649.395833333336 | 7.87 |
| 44649.40625 | 7.88 |
| 44649.416666666664 | 7.88 |
| 44649.427083333336 | 7.88 |
| 44649.4375 | 7.88 |
| 44649.447916666664 | 7.88 |
| 44649.458333333336 | 7.88 |
| 44649.46875 | 7.88 |
| 44649.479166666664 | 7.88 |
| 44649.489583333336 | 7.88 |
| 44649.5 | 7.88 |
| 44649.510416666664 | 7.88 |
| 44649.520833333336 | 7.88 |
| 44649.53125 | 7.88 |
| 44649.541666666664 | 7.88 |
| 44649.552083333336 | 7.88 |
| 44649.5625 | 7.88 |
| 44649.572916666664 | 7.87 |
| 44649.583333333336 | 7.86 |
| 44649.59375 | 7.86 |
| 44649.604166666664 | 7.85 |
| 44649.614583333336 | 7.85 |
| 44649.625 | 7.85 |
| 44649.635416666664 | 7.84 |
| 44649.645833333336 | 7.83 |
| 44649.65625 | 7.83 |
| 44649.666666666664 | 7.82 |
| 44649.677083333336 | 7.82 |
| 44649.6875 | 7.81 |
| 44649.697916666664 | 7.8 |
| 44649.708333333336 | 7.79 |
| 44649.71875 | 7.8 |
| 44649.729166666664 | 7.8 |
| 44649.739583333336 | 7.8 |
| 44649.75 | 7.8 |
| 44649.760416666664 | 7.81 |
| 44649.770833333336 | 7.81 |
| 44649.78125 | 7.81 |
| 44649.791666666664 | 7.82 |
| 44649.802083333336 | 7.88 |
| 44649.8125 | 7.9 |
| 44649.822916666664 | 7.91 |
| 44649.833333333336 | 7.92 |
| 44649.84375 | 7.92 |
| 44649.854166666664 | 7.92 |
| 44649.864583333336 | 7.93 |
| 44649.875 | 7.94 |
| 44649.885416666664 | 7.94 |
| 44649.895833333336 | 7.94 |
| 44649.90625 | 7.95 |
| 44649.916666666664 | 7.94 |
| 44649.927083333336 | 7.94 |
| 44649.9375 | 7.93 |
| 44649.947916666664 | 7.93 |
| 44649.958333333336 | 7.93 |
| 44649.96875 | 7.93 |
| 44649.979166666664 | 7.92 |
| 44649.989583333336 | 7.92 |
| 44650.0 | 7.92 |
| 44650.010416666664 | 7.92 |
| 44650.020833333336 | 7.92 |
| 44650.03125 | 7.92 |
| 44650.041666666664 | 7.92 |
| 44650.052083333336 | 7.92 |
| 44650.0625 | 7.91 |
| 44650.072916666664 | 7.9 |
| 44650.083333333336 | 7.9 |
| 44650.09375 | 7.9 |
| 44650.104166666664 | 7.9 |
| 44650.114583333336 | 7.89 |
| 44650.125 | 7.89 |
| 44650.135416666664 | 7.88 |
| 44650.145833333336 | 7.87 |
| 44650.15625 | 7.86 |
| 44650.166666666664 | 7.84 |
| 44650.177083333336 | 7.83 |
| 44650.1875 | 7.81 |
| 44650.197916666664 | 7.8 |
| 44650.208333333336 | 7.8 |
| 44650.21875 | 7.79 |
| 44650.229166666664 | 7.79 |
| 44650.239583333336 | 7.79 |
| 44650.25 | 7.78 |
| 44650.260416666664 | 7.79 |
| 44650.270833333336 | 7.79 |
| 44650.28125 | 7.8 |
| 44650.291666666664 | 7.8 |
| 44650.302083333336 | 7.8 |
| 44650.3125 | 7.81 |
| 44650.322916666664 | 7.83 |
| 44650.333333333336 | 7.84 |
| 44650.34375 | 7.85 |
| 44650.354166666664 | 7.85 |
| 44650.364583333336 | 7.85 |
| 44650.375 | 7.85 |
| 44650.385416666664 | 7.85 |
| 44650.395833333336 | 7.85 |
| 44650.40625 | 7.86 |
| 44650.416666666664 | 7.86 |
| 44650.427083333336 | 7.86 |
| 44650.4375 | 7.87 |
| 44650.447916666664 | 7.88 |
| 44650.458333333336 | 7.88 |
| 44650.46875 | 7.88 |
| 44650.479166666664 | 7.88 |
| 44650.489583333336 | 7.88 |
| 44650.5 | 7.88 |
| 44650.510416666664 | 7.89 |
| 44650.520833333336 | 7.88 |
| 44650.53125 | 7.88 |
| 44650.541666666664 | 7.88 |
| 44650.552083333336 | 7.88 |
| 44650.5625 | 7.87 |
| 44650.572916666664 | 7.88 |
| 44650.583333333336 | 7.87 |
| 44650.59375 | 7.87 |
| 44650.604166666664 | 7.86 |
| 44650.614583333336 | 7.85 |
| 44650.625 | 7.84 |
| 44650.635416666664 | 7.84 |
| 44650.645833333336 | 7.85 |
| 44650.65625 | 7.84 |
| 44650.666666666664 | 7.84 |
| 44650.677083333336 | 7.83 |
| 44650.6875 | 7.83 |
| 44650.697916666664 | 7.83 |
| 44650.708333333336 | 7.82 |
| 44650.71875 | 7.82 |
| 44650.729166666664 | 7.81 |
| 44650.739583333336 | 7.65 |
| 44650.75 | 7.65 |
| 44650.760416666664 | 7.65 |
| 44650.770833333336 | 7.65 |
| 44650.78125 | 7.66 |
| 44650.791666666664 | 7.66 |
| 44650.802083333336 | 7.66 |
| 44650.8125 | 7.68 |
| 44650.822916666664 | 7.7 |
| 44650.833333333336 | 7.73 |
| 44650.84375 | 7.78 |
| 44650.854166666664 | 7.79 |
| 44650.864583333336 | 7.81 |
| 44650.875 | 7.82 |
| 44650.885416666664 | 7.82 |
| 44650.895833333336 | 7.83 |
| 44650.90625 | 7.83 |
| 44650.916666666664 | 7.83 |
| 44650.927083333336 | 7.83 |
| 44650.9375 | 7.82 |
| 44650.947916666664 | 7.83 |
| 44650.958333333336 | 7.83 |
| 44650.96875 | 7.83 |
| 44650.979166666664 | 7.83 |
| 44650.989583333336 | 7.83 |
| 44651.0 | 7.83 |
| 44651.010416666664 | 7.83 |
| 44651.020833333336 | 7.83 |
| 44651.03125 | 7.83 |
| 44651.041666666664 | 7.83 |
| 44651.052083333336 | 7.83 |
| 44651.0625 | 7.83 |
| 44651.072916666664 | 7.83 |
| 44651.083333333336 | 7.82 |
| 44651.09375 | 7.82 |
| 44651.104166666664 | 7.81 |
| 44651.114583333336 | 7.81 |
| 44651.125 | 7.81 |
| 44651.135416666664 | 7.78 |
| 44651.145833333336 | 7.77 |
| 44651.15625 | 7.77 |
| 44651.166666666664 | 7.79 |
| 44651.177083333336 | 7.8 |
| 44651.1875 | 7.79 |
| 44651.197916666664 | 7.78 |
| 44651.208333333336 | 7.77 |
| 44651.21875 | 7.75 |
| 44651.229166666664 | 7.74 |
| 44651.239583333336 | 7.72 |
| 44651.25 | 7.71 |
| 44651.260416666664 | 7.69 |
| 44651.270833333336 | 7.68 |
| 44651.28125 | 7.68 |
| 44651.291666666664 | 7.68 |
| 44651.302083333336 | 7.68 |
| 44651.3125 | 7.68 |
| 44651.322916666664 | 7.68 |
| 44651.333333333336 | 7.69 |
| 44651.34375 | 7.7 |
| 44651.354166666664 | 7.72 |
| 44651.364583333336 | 7.74 |
| 44651.375 | 7.75 |
| 44651.385416666664 | 7.75 |
| 44651.395833333336 | 7.75 |
| 44651.40625 | 7.76 |
| 44651.416666666664 | 7.76 |
| 44651.427083333336 | 7.77 |
| 44651.4375 | 7.77 |
| 44651.447916666664 | 7.77 |
| 44651.458333333336 | 7.78 |
| 44651.46875 | 7.78 |
| 44651.479166666664 | 7.78 |
| 44651.489583333336 | 7.78 |
| 44651.5 | 7.78 |
| 44651.510416666664 | 7.78 |
| 44651.520833333336 | 7.78 |
| 44651.53125 | 7.78 |
| 44651.541666666664 | 7.78 |
| 44651.552083333336 | 7.78 |
| 44651.5625 | 7.78 |
| 44651.572916666664 | 7.78 |
| 44651.583333333336 | 7.78 |
| 44651.59375 | 7.78 |
| 44651.604166666664 | 7.78 |
| 44651.614583333336 | 7.78 |
| 44651.625 | 7.77 |
| 44651.635416666664 | 7.77 |
| 44651.645833333336 | 7.77 |
| 44651.65625 | 7.76 |
| 44651.666666666664 | 7.76 |
| 44651.677083333336 | 7.76 |
| 44651.6875 | 7.76 |
| 44651.697916666664 | 7.75 |
| 44651.708333333336 | 7.75 |
| 44651.71875 | 7.74 |
| 44651.729166666664 | 7.74 |
| 44651.739583333336 | 7.73 |
| 44651.75 | 7.73 |
| 44651.760416666664 | 7.73 |
| 44651.770833333336 | 7.73 |
| 44651.78125 | 7.72 |
| 44651.791666666664 | 7.72 |
| 44651.802083333336 | 7.72 |
| 44651.8125 | 7.72 |
| 44651.822916666664 | 7.72 |
| 44651.833333333336 | 7.72 |
| 44651.84375 | 7.72 |
| 44651.854166666664 | 7.73 |
| 44651.864583333336 | 7.74 |
| 44651.875 | 7.74 |
| 44651.885416666664 | 7.75 |
| 44651.895833333336 | 7.75 |
| 44651.90625 | 7.76 |
| 44651.916666666664 | 7.76 |
| 44651.927083333336 | 7.76 |
| 44651.9375 | 7.77 |
| 44651.947916666664 | 7.76 |
| 44651.958333333336 | 7.76 |
| 44651.96875 | 7.76 |
| 44651.979166666664 | 7.77 |
| 44651.989583333336 | 7.77 |
| 44652.0 | 7.77 |
| 44652.010416666664 | 7.77 |
| 44652.020833333336 | 7.77 |
| 44652.03125 | 7.77 |
| 44652.041666666664 | 7.76 |
| 44652.052083333336 | 7.76 |
| 44652.0625 | 7.76 |
| 44652.072916666664 | 7.76 |
| 44652.083333333336 | 7.76 |
| 44652.09375 | 7.75 |
| 44652.104166666664 | 7.76 |
| 44652.114583333336 | 7.75 |
| 44652.125 | 7.74 |
| 44652.135416666664 | 7.72 |
| 44652.145833333336 | 7.72 |